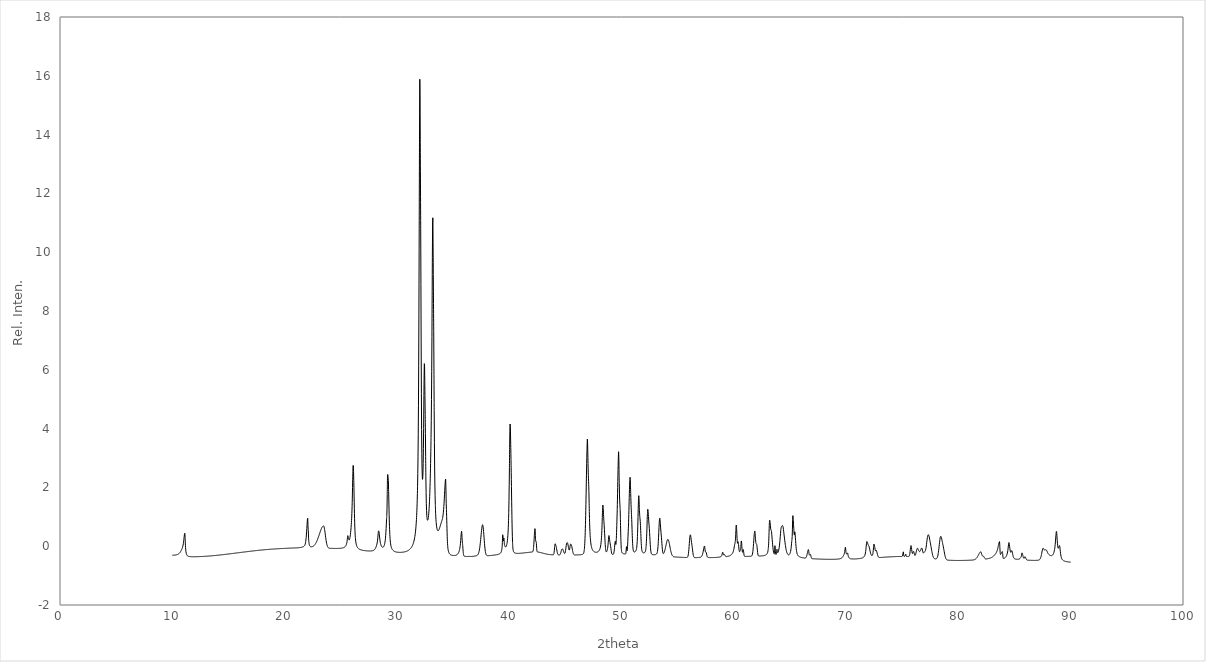
| Category | S4 |
|---|---|
| 10.0 | -0.306 |
| 10.02 | -0.306 |
| 10.04 | -0.306 |
| 10.06 | -0.306 |
| 10.08 | -0.306 |
| 10.1 | -0.306 |
| 10.12 | -0.305 |
| 10.14 | -0.305 |
| 10.16 | -0.304 |
| 10.18 | -0.304 |
| 10.2 | -0.303 |
| 10.22 | -0.302 |
| 10.24 | -0.302 |
| 10.26 | -0.301 |
| 10.28 | -0.3 |
| 10.3 | -0.298 |
| 10.32 | -0.297 |
| 10.34 | -0.295 |
| 10.36 | -0.294 |
| 10.38 | -0.292 |
| 10.4 | -0.289 |
| 10.42 | -0.287 |
| 10.44 | -0.284 |
| 10.46 | -0.281 |
| 10.48 | -0.278 |
| 10.5 | -0.274 |
| 10.52 | -0.27 |
| 10.54 | -0.266 |
| 10.56 | -0.261 |
| 10.58 | -0.255 |
| 10.6 | -0.249 |
| 10.62 | -0.242 |
| 10.64 | -0.234 |
| 10.66 | -0.226 |
| 10.68 | -0.217 |
| 10.7 | -0.206 |
| 10.72 | -0.195 |
| 10.74 | -0.183 |
| 10.76 | -0.169 |
| 10.78 | -0.155 |
| 10.8 | -0.14 |
| 10.82 | -0.125 |
| 10.84 | -0.108 |
| 10.86 | -0.09 |
| 10.88 | -0.071 |
| 10.9 | -0.05 |
| 10.92 | -0.025 |
| 10.94 | 0.004 |
| 10.96 | 0.039 |
| 10.98 | 0.082 |
| 11.0 | 0.135 |
| 11.02 | 0.197 |
| 11.04 | 0.265 |
| 11.06 | 0.334 |
| 11.08 | 0.395 |
| 11.1 | 0.438 |
| 11.12 | 0.437 |
| 11.14 | 0.291 |
| 11.16 | 0.106 |
| 11.18 | -0.044 |
| 11.2 | -0.137 |
| 11.22 | -0.197 |
| 11.24 | -0.239 |
| 11.26 | -0.268 |
| 11.28 | -0.289 |
| 11.3 | -0.304 |
| 11.32 | -0.314 |
| 11.34 | -0.323 |
| 11.36 | -0.329 |
| 11.38 | -0.334 |
| 11.4 | -0.338 |
| 11.42 | -0.341 |
| 11.44 | -0.344 |
| 11.46 | -0.346 |
| 11.48 | -0.348 |
| 11.5 | -0.349 |
| 11.52 | -0.35 |
| 11.54 | -0.352 |
| 11.56 | -0.353 |
| 11.58 | -0.353 |
| 11.6 | -0.354 |
| 11.62 | -0.355 |
| 11.64 | -0.355 |
| 11.66 | -0.356 |
| 11.68 | -0.356 |
| 11.7 | -0.357 |
| 11.72 | -0.357 |
| 11.74 | -0.357 |
| 11.76 | -0.358 |
| 11.78 | -0.358 |
| 11.8 | -0.358 |
| 11.82 | -0.358 |
| 11.84 | -0.358 |
| 11.86 | -0.358 |
| 11.88 | -0.358 |
| 11.9 | -0.358 |
| 11.92 | -0.358 |
| 11.94 | -0.358 |
| 11.96 | -0.358 |
| 11.98 | -0.358 |
| 12.0 | -0.358 |
| 12.02 | -0.358 |
| 12.04 | -0.358 |
| 12.06 | -0.358 |
| 12.08 | -0.358 |
| 12.1 | -0.358 |
| 12.12 | -0.358 |
| 12.14 | -0.358 |
| 12.16 | -0.357 |
| 12.18 | -0.357 |
| 12.2 | -0.357 |
| 12.22 | -0.357 |
| 12.24 | -0.357 |
| 12.26 | -0.356 |
| 12.28 | -0.356 |
| 12.3 | -0.356 |
| 12.32 | -0.356 |
| 12.34 | -0.355 |
| 12.36 | -0.355 |
| 12.38 | -0.355 |
| 12.4 | -0.355 |
| 12.42 | -0.354 |
| 12.44 | -0.354 |
| 12.46 | -0.354 |
| 12.48 | -0.353 |
| 12.5 | -0.353 |
| 12.52 | -0.353 |
| 12.54 | -0.352 |
| 12.56 | -0.352 |
| 12.58 | -0.352 |
| 12.6 | -0.351 |
| 12.62 | -0.351 |
| 12.64 | -0.35 |
| 12.66 | -0.35 |
| 12.68 | -0.35 |
| 12.7 | -0.349 |
| 12.72 | -0.349 |
| 12.74 | -0.348 |
| 12.76 | -0.348 |
| 12.78 | -0.347 |
| 12.8 | -0.347 |
| 12.82 | -0.347 |
| 12.84 | -0.346 |
| 12.86 | -0.346 |
| 12.88 | -0.345 |
| 12.9 | -0.345 |
| 12.92 | -0.344 |
| 12.94 | -0.344 |
| 12.96 | -0.343 |
| 12.98 | -0.343 |
| 13.0 | -0.342 |
| 13.02 | -0.342 |
| 13.04 | -0.341 |
| 13.06 | -0.34 |
| 13.08 | -0.34 |
| 13.1 | -0.339 |
| 13.12 | -0.339 |
| 13.14 | -0.338 |
| 13.16 | -0.338 |
| 13.18 | -0.337 |
| 13.2 | -0.336 |
| 13.22 | -0.336 |
| 13.24 | -0.335 |
| 13.26 | -0.335 |
| 13.28 | -0.334 |
| 13.3 | -0.334 |
| 13.32 | -0.333 |
| 13.34 | -0.333 |
| 13.36 | -0.332 |
| 13.38 | -0.331 |
| 13.4 | -0.331 |
| 13.42 | -0.33 |
| 13.44 | -0.329 |
| 13.46 | -0.329 |
| 13.48 | -0.328 |
| 13.5 | -0.327 |
| 13.52 | -0.327 |
| 13.54 | -0.326 |
| 13.56 | -0.325 |
| 13.58 | -0.325 |
| 13.6 | -0.324 |
| 13.62 | -0.323 |
| 13.64 | -0.322 |
| 13.66 | -0.322 |
| 13.68 | -0.321 |
| 13.7 | -0.32 |
| 13.72 | -0.32 |
| 13.74 | -0.319 |
| 13.76 | -0.318 |
| 13.78 | -0.317 |
| 13.8 | -0.317 |
| 13.82 | -0.316 |
| 13.84 | -0.315 |
| 13.86 | -0.314 |
| 13.88 | -0.314 |
| 13.9 | -0.313 |
| 13.92 | -0.312 |
| 13.94 | -0.311 |
| 13.96 | -0.311 |
| 13.98 | -0.31 |
| 14.0 | -0.309 |
| 14.02 | -0.308 |
| 14.04 | -0.307 |
| 14.06 | -0.307 |
| 14.08 | -0.306 |
| 14.1 | -0.305 |
| 14.12 | -0.304 |
| 14.14 | -0.303 |
| 14.16 | -0.302 |
| 14.18 | -0.302 |
| 14.2 | -0.301 |
| 14.22 | -0.3 |
| 14.24 | -0.299 |
| 14.26 | -0.298 |
| 14.28 | -0.298 |
| 14.3 | -0.297 |
| 14.32 | -0.296 |
| 14.34 | -0.295 |
| 14.36 | -0.294 |
| 14.38 | -0.293 |
| 14.4 | -0.292 |
| 14.42 | -0.292 |
| 14.44 | -0.291 |
| 14.46 | -0.29 |
| 14.48 | -0.289 |
| 14.5 | -0.288 |
| 14.52 | -0.287 |
| 14.54 | -0.286 |
| 14.56 | -0.285 |
| 14.58 | -0.285 |
| 14.6 | -0.284 |
| 14.62 | -0.283 |
| 14.64 | -0.282 |
| 14.66 | -0.281 |
| 14.68 | -0.28 |
| 14.7 | -0.279 |
| 14.72 | -0.278 |
| 14.74 | -0.277 |
| 14.76 | -0.276 |
| 14.78 | -0.275 |
| 14.8 | -0.275 |
| 14.82 | -0.274 |
| 14.84 | -0.273 |
| 14.86 | -0.272 |
| 14.88 | -0.271 |
| 14.9 | -0.27 |
| 14.92 | -0.269 |
| 14.94 | -0.268 |
| 14.96 | -0.267 |
| 14.98 | -0.266 |
| 15.0 | -0.265 |
| 15.02 | -0.264 |
| 15.04 | -0.263 |
| 15.06 | -0.263 |
| 15.08 | -0.262 |
| 15.1 | -0.261 |
| 15.12 | -0.26 |
| 15.14 | -0.259 |
| 15.16 | -0.258 |
| 15.18 | -0.257 |
| 15.2 | -0.256 |
| 15.22 | -0.255 |
| 15.24 | -0.254 |
| 15.26 | -0.253 |
| 15.28 | -0.252 |
| 15.3 | -0.251 |
| 15.32 | -0.25 |
| 15.34 | -0.249 |
| 15.36 | -0.248 |
| 15.38 | -0.247 |
| 15.4 | -0.246 |
| 15.42 | -0.245 |
| 15.44 | -0.244 |
| 15.46 | -0.243 |
| 15.48 | -0.242 |
| 15.5 | -0.241 |
| 15.52 | -0.24 |
| 15.54 | -0.24 |
| 15.56 | -0.239 |
| 15.58 | -0.238 |
| 15.6 | -0.237 |
| 15.62 | -0.236 |
| 15.64 | -0.235 |
| 15.66 | -0.234 |
| 15.68 | -0.233 |
| 15.7 | -0.232 |
| 15.72 | -0.231 |
| 15.74 | -0.23 |
| 15.76 | -0.229 |
| 15.78 | -0.228 |
| 15.8 | -0.227 |
| 15.82 | -0.226 |
| 15.84 | -0.225 |
| 15.86 | -0.224 |
| 15.88 | -0.223 |
| 15.9 | -0.222 |
| 15.92 | -0.221 |
| 15.94 | -0.22 |
| 15.96 | -0.219 |
| 15.98 | -0.218 |
| 16.0 | -0.217 |
| 16.02 | -0.216 |
| 16.04 | -0.215 |
| 16.06 | -0.214 |
| 16.08 | -0.213 |
| 16.1 | -0.212 |
| 16.12 | -0.211 |
| 16.14 | -0.21 |
| 16.16 | -0.209 |
| 16.18 | -0.208 |
| 16.2 | -0.207 |
| 16.22 | -0.206 |
| 16.24 | -0.206 |
| 16.26 | -0.205 |
| 16.28 | -0.204 |
| 16.3 | -0.203 |
| 16.32 | -0.202 |
| 16.34 | -0.201 |
| 16.36 | -0.2 |
| 16.38 | -0.199 |
| 16.4 | -0.198 |
| 16.42 | -0.197 |
| 16.44 | -0.196 |
| 16.46 | -0.195 |
| 16.48 | -0.194 |
| 16.5 | -0.193 |
| 16.52 | -0.192 |
| 16.54 | -0.191 |
| 16.56 | -0.19 |
| 16.58 | -0.189 |
| 16.6 | -0.188 |
| 16.62 | -0.187 |
| 16.64 | -0.186 |
| 16.66 | -0.185 |
| 16.68 | -0.184 |
| 16.7 | -0.183 |
| 16.72 | -0.182 |
| 16.74 | -0.182 |
| 16.76 | -0.181 |
| 16.78 | -0.18 |
| 16.8 | -0.179 |
| 16.82 | -0.178 |
| 16.84 | -0.177 |
| 16.86 | -0.176 |
| 16.88 | -0.175 |
| 16.9 | -0.174 |
| 16.92 | -0.173 |
| 16.94 | -0.172 |
| 16.96 | -0.171 |
| 16.98 | -0.17 |
| 17.0 | -0.17 |
| 17.02 | -0.169 |
| 17.04 | -0.168 |
| 17.06 | -0.167 |
| 17.08 | -0.166 |
| 17.1 | -0.165 |
| 17.12 | -0.164 |
| 17.14 | -0.163 |
| 17.16 | -0.162 |
| 17.18 | -0.162 |
| 17.2 | -0.161 |
| 17.22 | -0.16 |
| 17.24 | -0.159 |
| 17.26 | -0.158 |
| 17.28 | -0.157 |
| 17.3 | -0.156 |
| 17.32 | -0.155 |
| 17.34 | -0.155 |
| 17.36 | -0.154 |
| 17.38 | -0.153 |
| 17.4 | -0.152 |
| 17.42 | -0.151 |
| 17.44 | -0.15 |
| 17.46 | -0.15 |
| 17.48 | -0.149 |
| 17.5 | -0.148 |
| 17.52 | -0.147 |
| 17.54 | -0.146 |
| 17.56 | -0.145 |
| 17.58 | -0.145 |
| 17.6 | -0.144 |
| 17.62 | -0.143 |
| 17.64 | -0.142 |
| 17.66 | -0.141 |
| 17.68 | -0.141 |
| 17.7 | -0.14 |
| 17.72 | -0.139 |
| 17.74 | -0.138 |
| 17.76 | -0.137 |
| 17.78 | -0.137 |
| 17.8 | -0.136 |
| 17.82 | -0.135 |
| 17.84 | -0.134 |
| 17.86 | -0.134 |
| 17.88 | -0.133 |
| 17.9 | -0.132 |
| 17.92 | -0.131 |
| 17.94 | -0.131 |
| 17.96 | -0.13 |
| 17.98 | -0.129 |
| 18.0 | -0.128 |
| 18.02 | -0.128 |
| 18.04 | -0.127 |
| 18.06 | -0.126 |
| 18.08 | -0.126 |
| 18.1 | -0.125 |
| 18.12 | -0.124 |
| 18.14 | -0.123 |
| 18.16 | -0.123 |
| 18.18 | -0.122 |
| 18.2 | -0.121 |
| 18.22 | -0.121 |
| 18.24 | -0.12 |
| 18.26 | -0.119 |
| 18.28 | -0.119 |
| 18.3 | -0.118 |
| 18.32 | -0.117 |
| 18.34 | -0.117 |
| 18.36 | -0.116 |
| 18.38 | -0.115 |
| 18.4 | -0.115 |
| 18.42 | -0.114 |
| 18.44 | -0.113 |
| 18.46 | -0.113 |
| 18.48 | -0.112 |
| 18.5 | -0.111 |
| 18.52 | -0.111 |
| 18.54 | -0.11 |
| 18.56 | -0.11 |
| 18.58 | -0.109 |
| 18.6 | -0.108 |
| 18.62 | -0.108 |
| 18.64 | -0.107 |
| 18.66 | -0.107 |
| 18.68 | -0.106 |
| 18.7 | -0.105 |
| 18.72 | -0.105 |
| 18.74 | -0.104 |
| 18.76 | -0.104 |
| 18.78 | -0.103 |
| 18.8 | -0.102 |
| 18.82 | -0.102 |
| 18.84 | -0.101 |
| 18.86 | -0.101 |
| 18.88 | -0.1 |
| 18.9 | -0.1 |
| 18.92 | -0.099 |
| 18.94 | -0.099 |
| 18.96 | -0.098 |
| 18.98 | -0.097 |
| 19.0 | -0.097 |
| 19.02 | -0.096 |
| 19.04 | -0.096 |
| 19.06 | -0.095 |
| 19.08 | -0.095 |
| 19.1 | -0.094 |
| 19.12 | -0.094 |
| 19.14 | -0.093 |
| 19.16 | -0.093 |
| 19.18 | -0.092 |
| 19.2 | -0.092 |
| 19.22 | -0.091 |
| 19.24 | -0.091 |
| 19.26 | -0.09 |
| 19.28 | -0.09 |
| 19.3 | -0.089 |
| 19.32 | -0.089 |
| 19.34 | -0.088 |
| 19.36 | -0.088 |
| 19.38 | -0.087 |
| 19.4 | -0.087 |
| 19.42 | -0.086 |
| 19.44 | -0.086 |
| 19.46 | -0.086 |
| 19.48 | -0.085 |
| 19.5 | -0.085 |
| 19.52 | -0.084 |
| 19.54 | -0.084 |
| 19.56 | -0.083 |
| 19.58 | -0.083 |
| 19.6 | -0.082 |
| 19.62 | -0.082 |
| 19.64 | -0.082 |
| 19.66 | -0.081 |
| 19.68 | -0.081 |
| 19.7 | -0.08 |
| 19.72 | -0.08 |
| 19.74 | -0.08 |
| 19.76 | -0.079 |
| 19.78 | -0.079 |
| 19.8 | -0.078 |
| 19.82 | -0.078 |
| 19.84 | -0.078 |
| 19.86 | -0.077 |
| 19.88 | -0.077 |
| 19.9 | -0.076 |
| 19.92 | -0.076 |
| 19.94 | -0.076 |
| 19.96 | -0.075 |
| 19.98 | -0.075 |
| 20.0 | -0.075 |
| 20.02 | -0.074 |
| 20.04 | -0.074 |
| 20.06 | -0.073 |
| 20.08 | -0.073 |
| 20.1 | -0.073 |
| 20.12 | -0.072 |
| 20.14 | -0.072 |
| 20.16 | -0.072 |
| 20.18 | -0.071 |
| 20.2 | -0.071 |
| 20.22 | -0.071 |
| 20.24 | -0.07 |
| 20.26 | -0.07 |
| 20.28 | -0.07 |
| 20.3 | -0.069 |
| 20.32 | -0.069 |
| 20.34 | -0.069 |
| 20.36 | -0.068 |
| 20.38 | -0.068 |
| 20.4 | -0.068 |
| 20.42 | -0.067 |
| 20.44 | -0.067 |
| 20.46 | -0.067 |
| 20.48 | -0.066 |
| 20.5 | -0.066 |
| 20.52 | -0.066 |
| 20.54 | -0.065 |
| 20.56 | -0.065 |
| 20.58 | -0.065 |
| 20.6 | -0.064 |
| 20.62 | -0.064 |
| 20.64 | -0.064 |
| 20.66 | -0.063 |
| 20.68 | -0.063 |
| 20.7 | -0.063 |
| 20.72 | -0.062 |
| 20.74 | -0.062 |
| 20.76 | -0.062 |
| 20.78 | -0.061 |
| 20.8 | -0.061 |
| 20.82 | -0.061 |
| 20.84 | -0.06 |
| 20.86 | -0.06 |
| 20.88 | -0.06 |
| 20.9 | -0.059 |
| 20.92 | -0.059 |
| 20.94 | -0.059 |
| 20.96 | -0.058 |
| 20.98 | -0.058 |
| 21.0 | -0.058 |
| 21.02 | -0.057 |
| 21.04 | -0.057 |
| 21.06 | -0.056 |
| 21.08 | -0.056 |
| 21.1 | -0.055 |
| 21.12 | -0.055 |
| 21.14 | -0.054 |
| 21.16 | -0.054 |
| 21.18 | -0.053 |
| 21.2 | -0.053 |
| 21.22 | -0.052 |
| 21.24 | -0.052 |
| 21.26 | -0.051 |
| 21.28 | -0.05 |
| 21.3 | -0.05 |
| 21.32 | -0.049 |
| 21.34 | -0.048 |
| 21.36 | -0.047 |
| 21.38 | -0.046 |
| 21.4 | -0.045 |
| 21.42 | -0.043 |
| 21.44 | -0.042 |
| 21.46 | -0.041 |
| 21.48 | -0.039 |
| 21.5 | -0.037 |
| 21.52 | -0.036 |
| 21.54 | -0.034 |
| 21.56 | -0.032 |
| 21.58 | -0.03 |
| 21.6 | -0.027 |
| 21.62 | -0.024 |
| 21.64 | -0.021 |
| 21.66 | -0.018 |
| 21.68 | -0.014 |
| 21.7 | -0.009 |
| 21.72 | -0.004 |
| 21.74 | 0.003 |
| 21.76 | 0.011 |
| 21.78 | 0.022 |
| 21.8 | 0.036 |
| 21.82 | 0.054 |
| 21.84 | 0.079 |
| 21.86 | 0.113 |
| 21.88 | 0.158 |
| 21.9 | 0.216 |
| 21.92 | 0.29 |
| 21.94 | 0.381 |
| 21.96 | 0.488 |
| 21.98 | 0.607 |
| 22.0 | 0.73 |
| 22.02 | 0.845 |
| 22.04 | 0.936 |
| 22.06 | 0.953 |
| 22.08 | 0.713 |
| 22.1 | 0.57 |
| 22.12 | 0.445 |
| 22.14 | 0.255 |
| 22.16 | 0.152 |
| 22.18 | 0.093 |
| 22.2 | 0.053 |
| 22.22 | 0.027 |
| 22.24 | 0.01 |
| 22.26 | -0.001 |
| 22.28 | -0.008 |
| 22.3 | -0.014 |
| 22.32 | -0.017 |
| 22.34 | -0.019 |
| 22.36 | -0.02 |
| 22.38 | -0.021 |
| 22.4 | -0.02 |
| 22.42 | -0.02 |
| 22.44 | -0.018 |
| 22.46 | -0.016 |
| 22.48 | -0.013 |
| 22.5 | -0.01 |
| 22.52 | -0.007 |
| 22.54 | -0.002 |
| 22.56 | 0.002 |
| 22.58 | 0.008 |
| 22.6 | 0.014 |
| 22.62 | 0.021 |
| 22.64 | 0.028 |
| 22.66 | 0.036 |
| 22.68 | 0.045 |
| 22.7 | 0.054 |
| 22.72 | 0.066 |
| 22.74 | 0.077 |
| 22.76 | 0.089 |
| 22.78 | 0.102 |
| 22.8 | 0.117 |
| 22.82 | 0.131 |
| 22.84 | 0.147 |
| 22.86 | 0.163 |
| 22.88 | 0.18 |
| 22.9 | 0.198 |
| 22.92 | 0.217 |
| 22.94 | 0.237 |
| 22.96 | 0.257 |
| 22.98 | 0.277 |
| 23.0 | 0.299 |
| 23.02 | 0.321 |
| 23.04 | 0.343 |
| 23.06 | 0.365 |
| 23.08 | 0.388 |
| 23.1 | 0.411 |
| 23.12 | 0.434 |
| 23.14 | 0.456 |
| 23.16 | 0.479 |
| 23.18 | 0.501 |
| 23.2 | 0.522 |
| 23.22 | 0.543 |
| 23.24 | 0.563 |
| 23.26 | 0.582 |
| 23.28 | 0.6 |
| 23.3 | 0.617 |
| 23.32 | 0.632 |
| 23.34 | 0.645 |
| 23.36 | 0.658 |
| 23.38 | 0.668 |
| 23.4 | 0.676 |
| 23.42 | 0.683 |
| 23.44 | 0.687 |
| 23.46 | 0.689 |
| 23.48 | 0.685 |
| 23.5 | 0.67 |
| 23.52 | 0.648 |
| 23.54 | 0.615 |
| 23.56 | 0.573 |
| 23.58 | 0.523 |
| 23.6 | 0.468 |
| 23.62 | 0.41 |
| 23.64 | 0.351 |
| 23.66 | 0.293 |
| 23.68 | 0.238 |
| 23.7 | 0.187 |
| 23.72 | 0.141 |
| 23.74 | 0.1 |
| 23.76 | 0.065 |
| 23.78 | 0.036 |
| 23.8 | 0.011 |
| 23.82 | -0.009 |
| 23.84 | -0.025 |
| 23.86 | -0.037 |
| 23.88 | -0.046 |
| 23.9 | -0.054 |
| 23.92 | -0.059 |
| 23.94 | -0.063 |
| 23.96 | -0.066 |
| 23.98 | -0.068 |
| 24.0 | -0.069 |
| 24.02 | -0.071 |
| 24.04 | -0.071 |
| 24.06 | -0.072 |
| 24.08 | -0.072 |
| 24.1 | -0.073 |
| 24.12 | -0.073 |
| 24.14 | -0.074 |
| 24.16 | -0.074 |
| 24.18 | -0.074 |
| 24.2 | -0.074 |
| 24.22 | -0.074 |
| 24.24 | -0.075 |
| 24.26 | -0.075 |
| 24.28 | -0.075 |
| 24.3 | -0.075 |
| 24.32 | -0.075 |
| 24.34 | -0.076 |
| 24.36 | -0.076 |
| 24.38 | -0.076 |
| 24.4 | -0.076 |
| 24.42 | -0.076 |
| 24.44 | -0.076 |
| 24.46 | -0.076 |
| 24.48 | -0.076 |
| 24.5 | -0.076 |
| 24.52 | -0.076 |
| 24.54 | -0.076 |
| 24.56 | -0.076 |
| 24.58 | -0.076 |
| 24.6 | -0.076 |
| 24.62 | -0.076 |
| 24.64 | -0.076 |
| 24.66 | -0.076 |
| 24.68 | -0.076 |
| 24.7 | -0.076 |
| 24.72 | -0.076 |
| 24.74 | -0.076 |
| 24.76 | -0.076 |
| 24.78 | -0.075 |
| 24.8 | -0.075 |
| 24.82 | -0.075 |
| 24.84 | -0.074 |
| 24.86 | -0.074 |
| 24.88 | -0.074 |
| 24.9 | -0.073 |
| 24.92 | -0.073 |
| 24.94 | -0.072 |
| 24.96 | -0.071 |
| 24.98 | -0.071 |
| 25.0 | -0.07 |
| 25.02 | -0.069 |
| 25.04 | -0.068 |
| 25.06 | -0.067 |
| 25.08 | -0.066 |
| 25.1 | -0.064 |
| 25.12 | -0.063 |
| 25.14 | -0.061 |
| 25.16 | -0.06 |
| 25.18 | -0.058 |
| 25.2 | -0.056 |
| 25.22 | -0.053 |
| 25.24 | -0.051 |
| 25.26 | -0.048 |
| 25.28 | -0.045 |
| 25.3 | -0.041 |
| 25.32 | -0.037 |
| 25.34 | -0.032 |
| 25.36 | -0.027 |
| 25.38 | -0.02 |
| 25.4 | -0.013 |
| 25.42 | -0.004 |
| 25.44 | 0.007 |
| 25.46 | 0.02 |
| 25.48 | 0.037 |
| 25.5 | 0.057 |
| 25.52 | 0.082 |
| 25.54 | 0.113 |
| 25.56 | 0.156 |
| 25.58 | 0.219 |
| 25.6 | 0.3 |
| 25.62 | 0.358 |
| 25.64 | 0.346 |
| 25.66 | 0.313 |
| 25.68 | 0.294 |
| 25.7 | 0.265 |
| 25.72 | 0.228 |
| 25.74 | 0.209 |
| 25.76 | 0.211 |
| 25.78 | 0.228 |
| 25.8 | 0.256 |
| 25.82 | 0.294 |
| 25.84 | 0.342 |
| 25.86 | 0.4 |
| 25.88 | 0.468 |
| 25.9 | 0.547 |
| 25.92 | 0.639 |
| 25.94 | 0.745 |
| 25.96 | 0.871 |
| 25.98 | 1.025 |
| 26.0 | 1.222 |
| 26.02 | 1.481 |
| 26.04 | 1.808 |
| 26.06 | 2.183 |
| 26.08 | 2.531 |
| 26.1 | 2.749 |
| 26.12 | 2.74 |
| 26.14 | 2.537 |
| 26.16 | 2.237 |
| 26.18 | 1.874 |
| 26.2 | 1.473 |
| 26.22 | 1.104 |
| 26.24 | 0.804 |
| 26.26 | 0.578 |
| 26.28 | 0.414 |
| 26.3 | 0.296 |
| 26.32 | 0.211 |
| 26.34 | 0.15 |
| 26.36 | 0.103 |
| 26.38 | 0.067 |
| 26.4 | 0.038 |
| 26.42 | 0.015 |
| 26.44 | -0.004 |
| 26.46 | -0.021 |
| 26.48 | -0.035 |
| 26.5 | -0.046 |
| 26.52 | -0.057 |
| 26.54 | -0.066 |
| 26.56 | -0.074 |
| 26.58 | -0.081 |
| 26.6 | -0.087 |
| 26.62 | -0.092 |
| 26.64 | -0.097 |
| 26.66 | -0.102 |
| 26.68 | -0.106 |
| 26.7 | -0.11 |
| 26.72 | -0.113 |
| 26.74 | -0.116 |
| 26.76 | -0.119 |
| 26.78 | -0.122 |
| 26.8 | -0.124 |
| 26.82 | -0.127 |
| 26.84 | -0.129 |
| 26.86 | -0.131 |
| 26.88 | -0.133 |
| 26.9 | -0.135 |
| 26.92 | -0.137 |
| 26.94 | -0.138 |
| 26.96 | -0.14 |
| 26.98 | -0.141 |
| 27.0 | -0.143 |
| 27.02 | -0.144 |
| 27.04 | -0.145 |
| 27.06 | -0.147 |
| 27.08 | -0.148 |
| 27.1 | -0.149 |
| 27.12 | -0.15 |
| 27.14 | -0.151 |
| 27.16 | -0.152 |
| 27.18 | -0.153 |
| 27.2 | -0.154 |
| 27.22 | -0.155 |
| 27.24 | -0.155 |
| 27.26 | -0.156 |
| 27.28 | -0.157 |
| 27.3 | -0.158 |
| 27.32 | -0.158 |
| 27.34 | -0.159 |
| 27.36 | -0.159 |
| 27.38 | -0.16 |
| 27.4 | -0.16 |
| 27.42 | -0.161 |
| 27.44 | -0.161 |
| 27.46 | -0.162 |
| 27.48 | -0.162 |
| 27.5 | -0.162 |
| 27.52 | -0.162 |
| 27.54 | -0.163 |
| 27.56 | -0.163 |
| 27.58 | -0.163 |
| 27.6 | -0.163 |
| 27.62 | -0.162 |
| 27.64 | -0.162 |
| 27.66 | -0.162 |
| 27.68 | -0.161 |
| 27.7 | -0.161 |
| 27.72 | -0.16 |
| 27.74 | -0.159 |
| 27.76 | -0.158 |
| 27.78 | -0.157 |
| 27.8 | -0.156 |
| 27.82 | -0.154 |
| 27.84 | -0.152 |
| 27.86 | -0.15 |
| 27.88 | -0.148 |
| 27.9 | -0.145 |
| 27.92 | -0.141 |
| 27.94 | -0.137 |
| 27.96 | -0.133 |
| 27.98 | -0.128 |
| 28.0 | -0.121 |
| 28.02 | -0.11 |
| 28.04 | -0.101 |
| 28.06 | -0.091 |
| 28.08 | -0.079 |
| 28.1 | -0.062 |
| 28.12 | -0.046 |
| 28.14 | -0.027 |
| 28.16 | -0.006 |
| 28.18 | 0.017 |
| 28.2 | 0.043 |
| 28.22 | 0.072 |
| 28.24 | 0.106 |
| 28.26 | 0.15 |
| 28.28 | 0.209 |
| 28.3 | 0.287 |
| 28.32 | 0.379 |
| 28.34 | 0.464 |
| 28.36 | 0.512 |
| 28.38 | 0.521 |
| 28.4 | 0.494 |
| 28.42 | 0.446 |
| 28.44 | 0.383 |
| 28.46 | 0.313 |
| 28.48 | 0.244 |
| 28.5 | 0.183 |
| 28.52 | 0.134 |
| 28.54 | 0.096 |
| 28.56 | 0.066 |
| 28.58 | 0.041 |
| 28.6 | 0.021 |
| 28.62 | 0.004 |
| 28.64 | -0.01 |
| 28.66 | -0.021 |
| 28.68 | -0.029 |
| 28.7 | -0.034 |
| 28.72 | -0.037 |
| 28.74 | -0.037 |
| 28.76 | -0.035 |
| 28.78 | -0.031 |
| 28.8 | -0.024 |
| 28.82 | -0.014 |
| 28.84 | -0.001 |
| 28.86 | 0.015 |
| 28.88 | 0.036 |
| 28.9 | 0.063 |
| 28.92 | 0.097 |
| 28.94 | 0.14 |
| 28.96 | 0.195 |
| 28.98 | 0.265 |
| 29.0 | 0.356 |
| 29.02 | 0.471 |
| 29.04 | 0.607 |
| 29.06 | 0.752 |
| 29.08 | 0.892 |
| 29.1 | 1.041 |
| 29.12 | 1.287 |
| 29.14 | 1.75 |
| 29.16 | 2.293 |
| 29.18 | 2.439 |
| 29.2 | 2.391 |
| 29.22 | 2.341 |
| 29.24 | 2.234 |
| 29.26 | 1.927 |
| 29.28 | 1.574 |
| 29.3 | 1.228 |
| 29.32 | 0.924 |
| 29.34 | 0.674 |
| 29.36 | 0.479 |
| 29.38 | 0.331 |
| 29.4 | 0.22 |
| 29.42 | 0.139 |
| 29.44 | 0.078 |
| 29.46 | 0.032 |
| 29.48 | -0.004 |
| 29.5 | -0.032 |
| 29.52 | -0.055 |
| 29.54 | -0.074 |
| 29.56 | -0.091 |
| 29.58 | -0.104 |
| 29.6 | -0.116 |
| 29.62 | -0.126 |
| 29.64 | -0.135 |
| 29.66 | -0.143 |
| 29.68 | -0.15 |
| 29.7 | -0.157 |
| 29.72 | -0.162 |
| 29.74 | -0.167 |
| 29.76 | -0.171 |
| 29.78 | -0.175 |
| 29.8 | -0.179 |
| 29.82 | -0.183 |
| 29.84 | -0.186 |
| 29.86 | -0.189 |
| 29.88 | -0.191 |
| 29.9 | -0.194 |
| 29.92 | -0.196 |
| 29.94 | -0.197 |
| 29.96 | -0.199 |
| 29.98 | -0.201 |
| 30.0 | -0.202 |
| 30.02 | -0.203 |
| 30.04 | -0.204 |
| 30.06 | -0.205 |
| 30.08 | -0.206 |
| 30.1 | -0.207 |
| 30.12 | -0.208 |
| 30.14 | -0.208 |
| 30.16 | -0.209 |
| 30.18 | -0.209 |
| 30.2 | -0.209 |
| 30.22 | -0.21 |
| 30.24 | -0.21 |
| 30.26 | -0.21 |
| 30.28 | -0.21 |
| 30.3 | -0.21 |
| 30.32 | -0.21 |
| 30.34 | -0.209 |
| 30.36 | -0.209 |
| 30.38 | -0.209 |
| 30.4 | -0.208 |
| 30.42 | -0.208 |
| 30.44 | -0.207 |
| 30.46 | -0.206 |
| 30.48 | -0.206 |
| 30.5 | -0.205 |
| 30.52 | -0.204 |
| 30.54 | -0.203 |
| 30.56 | -0.202 |
| 30.58 | -0.2 |
| 30.6 | -0.199 |
| 30.62 | -0.198 |
| 30.64 | -0.196 |
| 30.66 | -0.195 |
| 30.68 | -0.193 |
| 30.7 | -0.191 |
| 30.72 | -0.19 |
| 30.74 | -0.188 |
| 30.76 | -0.185 |
| 30.78 | -0.183 |
| 30.8 | -0.181 |
| 30.82 | -0.178 |
| 30.84 | -0.176 |
| 30.86 | -0.173 |
| 30.88 | -0.17 |
| 30.9 | -0.167 |
| 30.92 | -0.163 |
| 30.94 | -0.16 |
| 30.96 | -0.156 |
| 30.98 | -0.152 |
| 31.0 | -0.147 |
| 31.02 | -0.143 |
| 31.04 | -0.138 |
| 31.06 | -0.133 |
| 31.08 | -0.127 |
| 31.1 | -0.122 |
| 31.12 | -0.115 |
| 31.14 | -0.109 |
| 31.16 | -0.102 |
| 31.18 | -0.094 |
| 31.2 | -0.086 |
| 31.22 | -0.078 |
| 31.24 | -0.068 |
| 31.26 | -0.059 |
| 31.28 | -0.048 |
| 31.3 | -0.037 |
| 31.32 | -0.024 |
| 31.34 | -0.011 |
| 31.36 | 0.003 |
| 31.38 | 0.019 |
| 31.4 | 0.036 |
| 31.42 | 0.054 |
| 31.44 | 0.075 |
| 31.46 | 0.097 |
| 31.48 | 0.121 |
| 31.5 | 0.148 |
| 31.52 | 0.177 |
| 31.54 | 0.21 |
| 31.56 | 0.246 |
| 31.58 | 0.287 |
| 31.6 | 0.333 |
| 31.62 | 0.385 |
| 31.64 | 0.444 |
| 31.66 | 0.511 |
| 31.68 | 0.588 |
| 31.7 | 0.677 |
| 31.72 | 0.782 |
| 31.74 | 0.905 |
| 31.76 | 1.051 |
| 31.78 | 1.227 |
| 31.8 | 1.441 |
| 31.82 | 1.707 |
| 31.84 | 2.042 |
| 31.86 | 2.472 |
| 31.88 | 3.037 |
| 31.9 | 3.788 |
| 31.92 | 4.793 |
| 31.94 | 6.135 |
| 31.96 | 7.891 |
| 31.98 | 10.08 |
| 32.0 | 12.526 |
| 32.02 | 14.706 |
| 32.04 | 15.883 |
| 32.06 | 15.335 |
| 32.08 | 13.843 |
| 32.1 | 12.32 |
| 32.12 | 10.802 |
| 32.14 | 8.909 |
| 32.16 | 6.879 |
| 32.18 | 5.189 |
| 32.2 | 3.968 |
| 32.22 | 3.154 |
| 32.24 | 2.652 |
| 32.26 | 2.377 |
| 32.28 | 2.273 |
| 32.3 | 2.312 |
| 32.32 | 2.488 |
| 32.34 | 2.816 |
| 32.36 | 3.317 |
| 32.38 | 4.003 |
| 32.4 | 4.837 |
| 32.42 | 5.664 |
| 32.44 | 6.211 |
| 32.46 | 6.179 |
| 32.48 | 5.645 |
| 32.5 | 5.043 |
| 32.52 | 4.48 |
| 32.54 | 3.833 |
| 32.56 | 3.059 |
| 32.58 | 2.358 |
| 32.6 | 1.826 |
| 32.62 | 1.456 |
| 32.64 | 1.213 |
| 32.66 | 1.059 |
| 32.68 | 0.964 |
| 32.7 | 0.91 |
| 32.72 | 0.885 |
| 32.74 | 0.882 |
| 32.76 | 0.897 |
| 32.78 | 0.929 |
| 32.8 | 0.978 |
| 32.82 | 1.043 |
| 32.84 | 1.127 |
| 32.86 | 1.231 |
| 32.88 | 1.358 |
| 32.9 | 1.511 |
| 32.92 | 1.695 |
| 32.94 | 1.912 |
| 32.96 | 2.168 |
| 32.98 | 2.465 |
| 33.0 | 2.81 |
| 33.02 | 3.212 |
| 33.04 | 3.687 |
| 33.06 | 4.266 |
| 33.08 | 4.998 |
| 33.1 | 5.941 |
| 33.12 | 7.136 |
| 33.14 | 8.538 |
| 33.16 | 9.935 |
| 33.18 | 10.959 |
| 33.2 | 11.172 |
| 33.22 | 10.333 |
| 33.24 | 9.235 |
| 33.26 | 8.252 |
| 33.28 | 7.257 |
| 33.3 | 5.951 |
| 33.32 | 4.615 |
| 33.34 | 3.526 |
| 33.36 | 2.725 |
| 33.38 | 2.149 |
| 33.4 | 1.734 |
| 33.42 | 1.429 |
| 33.44 | 1.202 |
| 33.46 | 1.03 |
| 33.48 | 0.899 |
| 33.5 | 0.798 |
| 33.52 | 0.72 |
| 33.54 | 0.66 |
| 33.56 | 0.614 |
| 33.58 | 0.58 |
| 33.6 | 0.556 |
| 33.62 | 0.539 |
| 33.64 | 0.529 |
| 33.66 | 0.526 |
| 33.68 | 0.527 |
| 33.7 | 0.533 |
| 33.72 | 0.544 |
| 33.74 | 0.557 |
| 33.76 | 0.574 |
| 33.78 | 0.594 |
| 33.8 | 0.616 |
| 33.82 | 0.639 |
| 33.84 | 0.664 |
| 33.86 | 0.69 |
| 33.88 | 0.715 |
| 33.9 | 0.741 |
| 33.92 | 0.766 |
| 33.94 | 0.791 |
| 33.96 | 0.814 |
| 33.98 | 0.838 |
| 34.0 | 0.861 |
| 34.02 | 0.885 |
| 34.04 | 0.912 |
| 34.06 | 0.944 |
| 34.08 | 0.981 |
| 34.1 | 1.027 |
| 34.12 | 1.085 |
| 34.14 | 1.157 |
| 34.16 | 1.245 |
| 34.18 | 1.35 |
| 34.2 | 1.472 |
| 34.22 | 1.608 |
| 34.24 | 1.753 |
| 34.26 | 1.899 |
| 34.28 | 2.038 |
| 34.3 | 2.159 |
| 34.32 | 2.252 |
| 34.34 | 2.283 |
| 34.36 | 2.041 |
| 34.38 | 1.683 |
| 34.4 | 1.369 |
| 34.42 | 1.135 |
| 34.44 | 0.885 |
| 34.46 | 0.59 |
| 34.48 | 0.338 |
| 34.5 | 0.153 |
| 34.52 | 0.026 |
| 34.54 | -0.059 |
| 34.56 | -0.117 |
| 34.58 | -0.158 |
| 34.6 | -0.188 |
| 34.62 | -0.211 |
| 34.64 | -0.229 |
| 34.66 | -0.244 |
| 34.68 | -0.255 |
| 34.7 | -0.265 |
| 34.72 | -0.273 |
| 34.74 | -0.28 |
| 34.76 | -0.286 |
| 34.78 | -0.291 |
| 34.8 | -0.295 |
| 34.82 | -0.299 |
| 34.84 | -0.302 |
| 34.86 | -0.305 |
| 34.88 | -0.307 |
| 34.9 | -0.309 |
| 34.92 | -0.311 |
| 34.94 | -0.312 |
| 34.96 | -0.313 |
| 34.98 | -0.314 |
| 35.0 | -0.315 |
| 35.02 | -0.315 |
| 35.04 | -0.316 |
| 35.06 | -0.316 |
| 35.08 | -0.315 |
| 35.1 | -0.315 |
| 35.12 | -0.314 |
| 35.14 | -0.314 |
| 35.16 | -0.313 |
| 35.18 | -0.311 |
| 35.2 | -0.314 |
| 35.22 | -0.312 |
| 35.24 | -0.309 |
| 35.26 | -0.307 |
| 35.28 | -0.306 |
| 35.3 | -0.302 |
| 35.32 | -0.298 |
| 35.34 | -0.293 |
| 35.36 | -0.288 |
| 35.38 | -0.282 |
| 35.4 | -0.274 |
| 35.42 | -0.266 |
| 35.44 | -0.256 |
| 35.46 | -0.244 |
| 35.48 | -0.231 |
| 35.5 | -0.215 |
| 35.52 | -0.196 |
| 35.54 | -0.174 |
| 35.56 | -0.147 |
| 35.58 | -0.117 |
| 35.6 | -0.078 |
| 35.62 | -0.03 |
| 35.64 | 0.029 |
| 35.66 | 0.101 |
| 35.68 | 0.188 |
| 35.7 | 0.287 |
| 35.72 | 0.386 |
| 35.74 | 0.467 |
| 35.76 | 0.511 |
| 35.78 | 0.442 |
| 35.8 | 0.305 |
| 35.82 | 0.181 |
| 35.84 | 0.096 |
| 35.86 | 0.025 |
| 35.88 | -0.077 |
| 35.9 | -0.177 |
| 35.92 | -0.252 |
| 35.94 | -0.297 |
| 35.96 | -0.32 |
| 35.98 | -0.332 |
| 36.0 | -0.338 |
| 36.02 | -0.34 |
| 36.04 | -0.343 |
| 36.06 | -0.345 |
| 36.08 | -0.347 |
| 36.1 | -0.348 |
| 36.12 | -0.348 |
| 36.14 | -0.349 |
| 36.16 | -0.349 |
| 36.18 | -0.349 |
| 36.2 | -0.35 |
| 36.22 | -0.35 |
| 36.24 | -0.35 |
| 36.26 | -0.35 |
| 36.28 | -0.35 |
| 36.3 | -0.35 |
| 36.32 | -0.35 |
| 36.34 | -0.35 |
| 36.36 | -0.349 |
| 36.38 | -0.349 |
| 36.4 | -0.349 |
| 36.42 | -0.349 |
| 36.44 | -0.348 |
| 36.46 | -0.348 |
| 36.48 | -0.348 |
| 36.5 | -0.347 |
| 36.52 | -0.351 |
| 36.54 | -0.35 |
| 36.56 | -0.35 |
| 36.58 | -0.349 |
| 36.6 | -0.35 |
| 36.62 | -0.35 |
| 36.64 | -0.349 |
| 36.66 | -0.349 |
| 36.68 | -0.348 |
| 36.7 | -0.347 |
| 36.72 | -0.347 |
| 36.74 | -0.346 |
| 36.76 | -0.345 |
| 36.78 | -0.344 |
| 36.8 | -0.344 |
| 36.82 | -0.343 |
| 36.84 | -0.342 |
| 36.86 | -0.341 |
| 36.88 | -0.34 |
| 36.9 | -0.339 |
| 36.92 | -0.338 |
| 36.94 | -0.337 |
| 36.96 | -0.335 |
| 36.98 | -0.334 |
| 37.0 | -0.332 |
| 37.02 | -0.331 |
| 37.04 | -0.329 |
| 37.06 | -0.327 |
| 37.08 | -0.325 |
| 37.1 | -0.322 |
| 37.12 | -0.318 |
| 37.14 | -0.314 |
| 37.16 | -0.309 |
| 37.18 | -0.302 |
| 37.2 | -0.294 |
| 37.22 | -0.283 |
| 37.24 | -0.27 |
| 37.26 | -0.253 |
| 37.28 | -0.231 |
| 37.3 | -0.206 |
| 37.32 | -0.174 |
| 37.34 | -0.137 |
| 37.36 | -0.092 |
| 37.38 | -0.041 |
| 37.4 | 0.017 |
| 37.42 | 0.083 |
| 37.44 | 0.154 |
| 37.46 | 0.23 |
| 37.48 | 0.309 |
| 37.5 | 0.389 |
| 37.52 | 0.467 |
| 37.54 | 0.541 |
| 37.56 | 0.608 |
| 37.58 | 0.663 |
| 37.6 | 0.704 |
| 37.62 | 0.729 |
| 37.64 | 0.727 |
| 37.66 | 0.699 |
| 37.68 | 0.647 |
| 37.7 | 0.577 |
| 37.72 | 0.494 |
| 37.74 | 0.398 |
| 37.76 | 0.297 |
| 37.78 | 0.196 |
| 37.8 | 0.099 |
| 37.82 | 0.011 |
| 37.84 | -0.066 |
| 37.86 | -0.131 |
| 37.88 | -0.184 |
| 37.9 | -0.225 |
| 37.92 | -0.257 |
| 37.94 | -0.28 |
| 37.96 | -0.296 |
| 37.98 | -0.307 |
| 38.0 | -0.315 |
| 38.02 | -0.319 |
| 38.04 | -0.322 |
| 38.06 | -0.323 |
| 38.08 | -0.323 |
| 38.1 | -0.323 |
| 38.12 | -0.323 |
| 38.14 | -0.323 |
| 38.16 | -0.322 |
| 38.18 | -0.322 |
| 38.2 | -0.321 |
| 38.22 | -0.32 |
| 38.24 | -0.32 |
| 38.26 | -0.319 |
| 38.28 | -0.319 |
| 38.3 | -0.318 |
| 38.32 | -0.317 |
| 38.34 | -0.317 |
| 38.36 | -0.316 |
| 38.38 | -0.315 |
| 38.4 | -0.314 |
| 38.42 | -0.314 |
| 38.44 | -0.313 |
| 38.46 | -0.312 |
| 38.48 | -0.311 |
| 38.5 | -0.311 |
| 38.52 | -0.31 |
| 38.54 | -0.309 |
| 38.56 | -0.308 |
| 38.58 | -0.307 |
| 38.6 | -0.306 |
| 38.62 | -0.305 |
| 38.64 | -0.305 |
| 38.66 | -0.304 |
| 38.68 | -0.303 |
| 38.7 | -0.302 |
| 38.72 | -0.301 |
| 38.74 | -0.299 |
| 38.76 | -0.298 |
| 38.78 | -0.297 |
| 38.8 | -0.296 |
| 38.82 | -0.295 |
| 38.84 | -0.293 |
| 38.86 | -0.292 |
| 38.88 | -0.29 |
| 38.9 | -0.289 |
| 38.92 | -0.287 |
| 38.94 | -0.286 |
| 38.96 | -0.284 |
| 38.98 | -0.282 |
| 39.0 | -0.28 |
| 39.02 | -0.278 |
| 39.04 | -0.275 |
| 39.06 | -0.273 |
| 39.08 | -0.27 |
| 39.1 | -0.267 |
| 39.12 | -0.263 |
| 39.14 | -0.259 |
| 39.16 | -0.255 |
| 39.18 | -0.25 |
| 39.2 | -0.244 |
| 39.22 | -0.237 |
| 39.24 | -0.228 |
| 39.26 | -0.217 |
| 39.28 | -0.203 |
| 39.3 | -0.183 |
| 39.32 | -0.156 |
| 39.34 | -0.116 |
| 39.36 | -0.056 |
| 39.38 | 0.043 |
| 39.4 | 0.21 |
| 39.42 | 0.39 |
| 39.44 | 0.358 |
| 39.46 | 0.215 |
| 39.48 | 0.178 |
| 39.5 | 0.224 |
| 39.52 | 0.281 |
| 39.54 | 0.234 |
| 39.56 | 0.119 |
| 39.58 | 0.054 |
| 39.6 | 0.026 |
| 39.62 | 0.006 |
| 39.64 | -0.013 |
| 39.66 | -0.025 |
| 39.68 | -0.029 |
| 39.7 | -0.025 |
| 39.72 | -0.015 |
| 39.74 | 0.001 |
| 39.76 | 0.023 |
| 39.78 | 0.052 |
| 39.8 | 0.088 |
| 39.82 | 0.135 |
| 39.84 | 0.193 |
| 39.86 | 0.266 |
| 39.88 | 0.36 |
| 39.9 | 0.484 |
| 39.92 | 0.647 |
| 39.94 | 0.865 |
| 39.96 | 1.158 |
| 39.98 | 1.548 |
| 40.0 | 2.054 |
| 40.02 | 2.674 |
| 40.04 | 3.346 |
| 40.06 | 3.905 |
| 40.08 | 4.156 |
| 40.1 | 4.064 |
| 40.12 | 3.75 |
| 40.14 | 3.359 |
| 40.16 | 2.956 |
| 40.18 | 2.518 |
| 40.2 | 2.029 |
| 40.22 | 1.525 |
| 40.24 | 1.052 |
| 40.26 | 0.651 |
| 40.28 | 0.341 |
| 40.3 | 0.123 |
| 40.32 | -0.018 |
| 40.34 | -0.103 |
| 40.36 | -0.151 |
| 40.38 | -0.179 |
| 40.4 | -0.195 |
| 40.42 | -0.206 |
| 40.44 | -0.214 |
| 40.46 | -0.22 |
| 40.48 | -0.225 |
| 40.5 | -0.229 |
| 40.52 | -0.232 |
| 40.54 | -0.235 |
| 40.56 | -0.237 |
| 40.58 | -0.239 |
| 40.6 | -0.24 |
| 40.62 | -0.242 |
| 40.64 | -0.243 |
| 40.66 | -0.243 |
| 40.68 | -0.244 |
| 40.7 | -0.244 |
| 40.72 | -0.245 |
| 40.74 | -0.245 |
| 40.76 | -0.245 |
| 40.78 | -0.245 |
| 40.8 | -0.245 |
| 40.82 | -0.245 |
| 40.84 | -0.244 |
| 40.86 | -0.244 |
| 40.88 | -0.244 |
| 40.9 | -0.243 |
| 40.92 | -0.243 |
| 40.94 | -0.242 |
| 40.96 | -0.242 |
| 40.98 | -0.241 |
| 41.0 | -0.241 |
| 41.02 | -0.24 |
| 41.04 | -0.239 |
| 41.06 | -0.239 |
| 41.08 | -0.238 |
| 41.1 | -0.237 |
| 41.12 | -0.236 |
| 41.14 | -0.235 |
| 41.16 | -0.235 |
| 41.18 | -0.234 |
| 41.2 | -0.233 |
| 41.22 | -0.232 |
| 41.24 | -0.231 |
| 41.26 | -0.23 |
| 41.28 | -0.229 |
| 41.3 | -0.229 |
| 41.32 | -0.228 |
| 41.34 | -0.227 |
| 41.36 | -0.226 |
| 41.38 | -0.225 |
| 41.4 | -0.224 |
| 41.42 | -0.223 |
| 41.44 | -0.222 |
| 41.46 | -0.221 |
| 41.48 | -0.22 |
| 41.5 | -0.22 |
| 41.52 | -0.219 |
| 41.54 | -0.218 |
| 41.56 | -0.217 |
| 41.58 | -0.216 |
| 41.6 | -0.215 |
| 41.62 | -0.214 |
| 41.64 | -0.213 |
| 41.66 | -0.212 |
| 41.68 | -0.212 |
| 41.7 | -0.211 |
| 41.72 | -0.21 |
| 41.74 | -0.21 |
| 41.76 | -0.209 |
| 41.78 | -0.208 |
| 41.8 | -0.208 |
| 41.82 | -0.207 |
| 41.84 | -0.206 |
| 41.86 | -0.205 |
| 41.88 | -0.205 |
| 41.9 | -0.204 |
| 41.92 | -0.203 |
| 41.94 | -0.203 |
| 41.96 | -0.202 |
| 41.98 | -0.201 |
| 42.0 | -0.201 |
| 42.02 | -0.2 |
| 42.04 | -0.199 |
| 42.06 | -0.197 |
| 42.08 | -0.192 |
| 42.1 | -0.183 |
| 42.12 | -0.165 |
| 42.14 | -0.132 |
| 42.16 | -0.079 |
| 42.18 | 0.001 |
| 42.2 | 0.109 |
| 42.22 | 0.237 |
| 42.24 | 0.371 |
| 42.26 | 0.492 |
| 42.28 | 0.581 |
| 42.3 | 0.598 |
| 42.32 | 0.448 |
| 42.34 | 0.272 |
| 42.36 | 0.18 |
| 42.38 | 0.161 |
| 42.4 | 0.159 |
| 42.42 | 0.095 |
| 42.44 | -0.028 |
| 42.46 | -0.127 |
| 42.48 | -0.177 |
| 42.5 | -0.193 |
| 42.52 | -0.197 |
| 42.54 | -0.198 |
| 42.56 | -0.199 |
| 42.58 | -0.2 |
| 42.6 | -0.201 |
| 42.62 | -0.202 |
| 42.64 | -0.204 |
| 42.66 | -0.205 |
| 42.68 | -0.206 |
| 42.7 | -0.208 |
| 42.72 | -0.209 |
| 42.74 | -0.211 |
| 42.76 | -0.213 |
| 42.78 | -0.215 |
| 42.8 | -0.216 |
| 42.82 | -0.218 |
| 42.84 | -0.22 |
| 42.86 | -0.222 |
| 42.88 | -0.224 |
| 42.9 | -0.226 |
| 42.92 | -0.229 |
| 42.94 | -0.231 |
| 42.96 | -0.233 |
| 42.98 | -0.235 |
| 43.0 | -0.237 |
| 43.02 | -0.239 |
| 43.04 | -0.241 |
| 43.06 | -0.243 |
| 43.08 | -0.245 |
| 43.1 | -0.247 |
| 43.12 | -0.249 |
| 43.14 | -0.251 |
| 43.16 | -0.253 |
| 43.18 | -0.255 |
| 43.2 | -0.257 |
| 43.22 | -0.259 |
| 43.24 | -0.261 |
| 43.26 | -0.263 |
| 43.28 | -0.264 |
| 43.3 | -0.266 |
| 43.32 | -0.267 |
| 43.34 | -0.269 |
| 43.36 | -0.271 |
| 43.38 | -0.272 |
| 43.4 | -0.273 |
| 43.42 | -0.275 |
| 43.44 | -0.276 |
| 43.46 | -0.277 |
| 43.48 | -0.278 |
| 43.5 | -0.279 |
| 43.52 | -0.281 |
| 43.54 | -0.282 |
| 43.56 | -0.283 |
| 43.58 | -0.283 |
| 43.6 | -0.284 |
| 43.62 | -0.285 |
| 43.64 | -0.286 |
| 43.66 | -0.287 |
| 43.68 | -0.287 |
| 43.7 | -0.288 |
| 43.72 | -0.289 |
| 43.74 | -0.289 |
| 43.76 | -0.29 |
| 43.78 | -0.291 |
| 43.8 | -0.291 |
| 43.82 | -0.292 |
| 43.84 | -0.292 |
| 43.86 | -0.293 |
| 43.88 | -0.293 |
| 43.9 | -0.293 |
| 43.92 | -0.292 |
| 43.94 | -0.289 |
| 43.96 | -0.279 |
| 43.98 | -0.255 |
| 44.0 | -0.21 |
| 44.02 | -0.14 |
| 44.04 | -0.053 |
| 44.06 | 0.028 |
| 44.08 | 0.075 |
| 44.1 | 0.081 |
| 44.12 | 0.066 |
| 44.14 | 0.042 |
| 44.16 | 0.017 |
| 44.18 | -0.009 |
| 44.2 | -0.044 |
| 44.22 | -0.086 |
| 44.24 | -0.128 |
| 44.26 | -0.171 |
| 44.28 | -0.21 |
| 44.3 | -0.242 |
| 44.32 | -0.265 |
| 44.34 | -0.281 |
| 44.36 | -0.289 |
| 44.38 | -0.294 |
| 44.4 | -0.296 |
| 44.42 | -0.297 |
| 44.44 | -0.297 |
| 44.46 | -0.297 |
| 44.48 | -0.296 |
| 44.5 | -0.294 |
| 44.52 | -0.289 |
| 44.54 | -0.28 |
| 44.56 | -0.265 |
| 44.58 | -0.244 |
| 44.6 | -0.216 |
| 44.62 | -0.184 |
| 44.64 | -0.151 |
| 44.66 | -0.124 |
| 44.68 | -0.106 |
| 44.7 | -0.097 |
| 44.72 | -0.093 |
| 44.74 | -0.094 |
| 44.76 | -0.099 |
| 44.78 | -0.111 |
| 44.8 | -0.129 |
| 44.82 | -0.151 |
| 44.84 | -0.174 |
| 44.86 | -0.196 |
| 44.88 | -0.215 |
| 44.9 | -0.232 |
| 44.92 | -0.243 |
| 44.94 | -0.247 |
| 44.96 | -0.242 |
| 44.98 | -0.224 |
| 45.0 | -0.193 |
| 45.02 | -0.147 |
| 45.04 | -0.091 |
| 45.06 | -0.029 |
| 45.08 | 0.028 |
| 45.1 | 0.074 |
| 45.12 | 0.1 |
| 45.14 | 0.116 |
| 45.16 | 0.122 |
| 45.18 | 0.12 |
| 45.2 | 0.106 |
| 45.22 | 0.08 |
| 45.24 | 0.042 |
| 45.26 | -0.001 |
| 45.28 | -0.044 |
| 45.3 | -0.083 |
| 45.32 | -0.114 |
| 45.34 | -0.132 |
| 45.36 | -0.129 |
| 45.38 | -0.103 |
| 45.4 | -0.057 |
| 45.42 | -0.002 |
| 45.44 | 0.045 |
| 45.46 | 0.069 |
| 45.48 | 0.072 |
| 45.5 | 0.067 |
| 45.52 | 0.057 |
| 45.54 | 0.041 |
| 45.56 | 0.017 |
| 45.58 | -0.018 |
| 45.6 | -0.06 |
| 45.62 | -0.102 |
| 45.64 | -0.143 |
| 45.66 | -0.18 |
| 45.68 | -0.212 |
| 45.7 | -0.239 |
| 45.72 | -0.259 |
| 45.74 | -0.274 |
| 45.76 | -0.284 |
| 45.78 | -0.29 |
| 45.8 | -0.294 |
| 45.82 | -0.296 |
| 45.84 | -0.297 |
| 45.86 | -0.298 |
| 45.88 | -0.298 |
| 45.9 | -0.298 |
| 45.92 | -0.298 |
| 45.94 | -0.297 |
| 45.96 | -0.297 |
| 45.98 | -0.297 |
| 46.0 | -0.297 |
| 46.02 | -0.297 |
| 46.04 | -0.296 |
| 46.06 | -0.296 |
| 46.08 | -0.296 |
| 46.1 | -0.295 |
| 46.12 | -0.295 |
| 46.14 | -0.295 |
| 46.16 | -0.294 |
| 46.18 | -0.294 |
| 46.2 | -0.294 |
| 46.22 | -0.293 |
| 46.24 | -0.293 |
| 46.26 | -0.292 |
| 46.28 | -0.292 |
| 46.3 | -0.291 |
| 46.32 | -0.29 |
| 46.34 | -0.29 |
| 46.36 | -0.289 |
| 46.38 | -0.288 |
| 46.4 | -0.287 |
| 46.42 | -0.286 |
| 46.44 | -0.285 |
| 46.46 | -0.284 |
| 46.48 | -0.283 |
| 46.5 | -0.281 |
| 46.52 | -0.279 |
| 46.54 | -0.276 |
| 46.56 | -0.273 |
| 46.58 | -0.267 |
| 46.6 | -0.258 |
| 46.62 | -0.245 |
| 46.64 | -0.224 |
| 46.66 | -0.191 |
| 46.68 | -0.142 |
| 46.7 | -0.07 |
| 46.72 | 0.032 |
| 46.74 | 0.172 |
| 46.76 | 0.358 |
| 46.78 | 0.594 |
| 46.8 | 0.883 |
| 46.82 | 1.222 |
| 46.84 | 1.603 |
| 46.86 | 2.01 |
| 46.88 | 2.425 |
| 46.9 | 2.821 |
| 46.92 | 3.174 |
| 46.94 | 3.457 |
| 46.96 | 3.642 |
| 46.98 | 3.518 |
| 47.0 | 3.17 |
| 47.02 | 2.81 |
| 47.04 | 2.519 |
| 47.06 | 2.291 |
| 47.08 | 2.092 |
| 47.1 | 1.813 |
| 47.12 | 1.443 |
| 47.14 | 1.09 |
| 47.16 | 0.804 |
| 47.18 | 0.587 |
| 47.2 | 0.424 |
| 47.22 | 0.301 |
| 47.24 | 0.206 |
| 47.26 | 0.132 |
| 47.28 | 0.074 |
| 47.3 | 0.026 |
| 47.32 | -0.012 |
| 47.34 | -0.043 |
| 47.36 | -0.069 |
| 47.38 | -0.091 |
| 47.4 | -0.109 |
| 47.42 | -0.125 |
| 47.44 | -0.138 |
| 47.46 | -0.15 |
| 47.48 | -0.159 |
| 47.5 | -0.167 |
| 47.52 | -0.175 |
| 47.54 | -0.181 |
| 47.56 | -0.186 |
| 47.58 | -0.191 |
| 47.6 | -0.195 |
| 47.62 | -0.198 |
| 47.64 | -0.201 |
| 47.66 | -0.203 |
| 47.68 | -0.204 |
| 47.7 | -0.206 |
| 47.72 | -0.206 |
| 47.74 | -0.207 |
| 47.76 | -0.206 |
| 47.78 | -0.206 |
| 47.8 | -0.205 |
| 47.82 | -0.203 |
| 47.84 | -0.201 |
| 47.86 | -0.198 |
| 47.88 | -0.195 |
| 47.9 | -0.191 |
| 47.92 | -0.186 |
| 47.94 | -0.18 |
| 47.96 | -0.172 |
| 47.98 | -0.164 |
| 48.0 | -0.154 |
| 48.02 | -0.142 |
| 48.04 | -0.128 |
| 48.06 | -0.11 |
| 48.08 | -0.089 |
| 48.1 | -0.064 |
| 48.12 | -0.032 |
| 48.14 | 0.007 |
| 48.16 | 0.056 |
| 48.18 | 0.119 |
| 48.2 | 0.199 |
| 48.22 | 0.303 |
| 48.24 | 0.441 |
| 48.26 | 0.622 |
| 48.28 | 0.848 |
| 48.3 | 1.098 |
| 48.32 | 1.309 |
| 48.34 | 1.398 |
| 48.36 | 1.36 |
| 48.38 | 1.237 |
| 48.4 | 1.078 |
| 48.42 | 0.931 |
| 48.44 | 0.813 |
| 48.46 | 0.699 |
| 48.48 | 0.568 |
| 48.5 | 0.423 |
| 48.52 | 0.272 |
| 48.54 | 0.129 |
| 48.56 | 0.006 |
| 48.58 | -0.085 |
| 48.6 | -0.145 |
| 48.62 | -0.178 |
| 48.64 | -0.192 |
| 48.66 | -0.191 |
| 48.68 | -0.182 |
| 48.7 | -0.167 |
| 48.72 | -0.145 |
| 48.74 | -0.116 |
| 48.76 | -0.077 |
| 48.78 | -0.026 |
| 48.8 | 0.042 |
| 48.82 | 0.131 |
| 48.84 | 0.232 |
| 48.86 | 0.322 |
| 48.88 | 0.362 |
| 48.9 | 0.346 |
| 48.92 | 0.291 |
| 48.94 | 0.222 |
| 48.96 | 0.16 |
| 48.98 | 0.116 |
| 49.0 | 0.078 |
| 49.02 | 0.033 |
| 49.04 | -0.022 |
| 49.06 | -0.082 |
| 49.08 | -0.141 |
| 49.1 | -0.191 |
| 49.12 | -0.23 |
| 49.14 | -0.255 |
| 49.16 | -0.27 |
| 49.18 | -0.278 |
| 49.2 | -0.282 |
| 49.22 | -0.283 |
| 49.24 | -0.282 |
| 49.26 | -0.279 |
| 49.28 | -0.272 |
| 49.3 | -0.257 |
| 49.32 | -0.23 |
| 49.34 | -0.185 |
| 49.36 | -0.122 |
| 49.38 | -0.044 |
| 49.4 | 0.039 |
| 49.42 | 0.112 |
| 49.44 | 0.163 |
| 49.46 | 0.159 |
| 49.48 | 0.086 |
| 49.5 | 0.058 |
| 49.52 | 0.12 |
| 49.54 | 0.262 |
| 49.56 | 0.461 |
| 49.58 | 0.704 |
| 49.6 | 0.958 |
| 49.62 | 1.249 |
| 49.64 | 1.601 |
| 49.66 | 1.998 |
| 49.68 | 2.395 |
| 49.7 | 2.753 |
| 49.72 | 3.036 |
| 49.74 | 3.213 |
| 49.76 | 3.045 |
| 49.78 | 2.608 |
| 49.8 | 2.137 |
| 49.82 | 1.771 |
| 49.84 | 1.54 |
| 49.86 | 1.401 |
| 49.88 | 1.256 |
| 49.9 | 0.966 |
| 49.92 | 0.616 |
| 49.94 | 0.3 |
| 49.96 | 0.069 |
| 49.98 | -0.074 |
| 50.0 | -0.152 |
| 50.02 | -0.192 |
| 50.04 | -0.213 |
| 50.06 | -0.225 |
| 50.08 | -0.234 |
| 50.1 | -0.24 |
| 50.12 | -0.245 |
| 50.14 | -0.249 |
| 50.16 | -0.252 |
| 50.18 | -0.255 |
| 50.2 | -0.258 |
| 50.22 | -0.26 |
| 50.24 | -0.261 |
| 50.26 | -0.263 |
| 50.28 | -0.264 |
| 50.3 | -0.265 |
| 50.32 | -0.266 |
| 50.34 | -0.266 |
| 50.36 | -0.263 |
| 50.38 | -0.248 |
| 50.4 | -0.202 |
| 50.42 | -0.112 |
| 50.44 | -0.022 |
| 50.46 | -0.017 |
| 50.48 | -0.127 |
| 50.5 | -0.16 |
| 50.52 | -0.109 |
| 50.54 | -0.003 |
| 50.56 | 0.156 |
| 50.58 | 0.341 |
| 50.6 | 0.507 |
| 50.62 | 0.681 |
| 50.64 | 0.929 |
| 50.66 | 1.219 |
| 50.68 | 1.518 |
| 50.7 | 1.8 |
| 50.72 | 2.046 |
| 50.74 | 2.237 |
| 50.76 | 2.345 |
| 50.78 | 2.27 |
| 50.8 | 2.058 |
| 50.82 | 1.792 |
| 50.84 | 1.538 |
| 50.86 | 1.325 |
| 50.88 | 1.156 |
| 50.9 | 0.999 |
| 50.92 | 0.798 |
| 50.94 | 0.573 |
| 50.96 | 0.357 |
| 50.98 | 0.173 |
| 51.0 | 0.033 |
| 51.02 | -0.063 |
| 51.04 | -0.124 |
| 51.06 | -0.16 |
| 51.08 | -0.179 |
| 51.1 | -0.189 |
| 51.12 | -0.194 |
| 51.14 | -0.196 |
| 51.16 | -0.196 |
| 51.18 | -0.194 |
| 51.2 | -0.19 |
| 51.22 | -0.185 |
| 51.24 | -0.178 |
| 51.26 | -0.168 |
| 51.28 | -0.155 |
| 51.3 | -0.138 |
| 51.32 | -0.114 |
| 51.34 | -0.079 |
| 51.36 | -0.027 |
| 51.38 | 0.051 |
| 51.4 | 0.167 |
| 51.42 | 0.331 |
| 51.44 | 0.551 |
| 51.46 | 0.824 |
| 51.48 | 1.133 |
| 51.5 | 1.433 |
| 51.52 | 1.652 |
| 51.54 | 1.718 |
| 51.56 | 1.608 |
| 51.58 | 1.405 |
| 51.6 | 1.204 |
| 51.62 | 1.057 |
| 51.64 | 0.965 |
| 51.66 | 0.891 |
| 51.68 | 0.785 |
| 51.7 | 0.621 |
| 51.72 | 0.429 |
| 51.74 | 0.245 |
| 51.76 | 0.092 |
| 51.78 | -0.023 |
| 51.8 | -0.102 |
| 51.82 | -0.151 |
| 51.84 | -0.181 |
| 51.86 | -0.198 |
| 51.88 | -0.209 |
| 51.9 | -0.217 |
| 51.92 | -0.221 |
| 51.94 | -0.224 |
| 51.96 | -0.226 |
| 51.98 | -0.226 |
| 52.0 | -0.225 |
| 52.02 | -0.223 |
| 52.04 | -0.22 |
| 52.06 | -0.215 |
| 52.08 | -0.208 |
| 52.1 | -0.197 |
| 52.12 | -0.181 |
| 52.14 | -0.156 |
| 52.16 | -0.116 |
| 52.18 | -0.054 |
| 52.2 | 0.038 |
| 52.22 | 0.169 |
| 52.24 | 0.342 |
| 52.26 | 0.554 |
| 52.28 | 0.788 |
| 52.3 | 1.014 |
| 52.32 | 1.185 |
| 52.34 | 1.255 |
| 52.36 | 1.226 |
| 52.38 | 1.13 |
| 52.4 | 1.007 |
| 52.42 | 0.889 |
| 52.44 | 0.788 |
| 52.46 | 0.696 |
| 52.48 | 0.593 |
| 52.5 | 0.47 |
| 52.52 | 0.334 |
| 52.54 | 0.195 |
| 52.56 | 0.066 |
| 52.58 | -0.043 |
| 52.6 | -0.127 |
| 52.62 | -0.187 |
| 52.64 | -0.227 |
| 52.66 | -0.252 |
| 52.68 | -0.267 |
| 52.7 | -0.275 |
| 52.72 | -0.281 |
| 52.74 | -0.284 |
| 52.76 | -0.286 |
| 52.78 | -0.288 |
| 52.8 | -0.289 |
| 52.82 | -0.29 |
| 52.84 | -0.29 |
| 52.86 | -0.291 |
| 52.88 | -0.291 |
| 52.9 | -0.291 |
| 52.92 | -0.291 |
| 52.94 | -0.29 |
| 52.96 | -0.289 |
| 52.98 | -0.288 |
| 53.0 | -0.287 |
| 53.02 | -0.285 |
| 53.04 | -0.283 |
| 53.06 | -0.28 |
| 53.08 | -0.277 |
| 53.1 | -0.272 |
| 53.12 | -0.265 |
| 53.14 | -0.255 |
| 53.16 | -0.24 |
| 53.18 | -0.218 |
| 53.2 | -0.183 |
| 53.22 | -0.132 |
| 53.24 | -0.06 |
| 53.26 | 0.037 |
| 53.28 | 0.161 |
| 53.3 | 0.308 |
| 53.32 | 0.472 |
| 53.34 | 0.638 |
| 53.36 | 0.788 |
| 53.38 | 0.899 |
| 53.4 | 0.954 |
| 53.42 | 0.939 |
| 53.44 | 0.867 |
| 53.46 | 0.763 |
| 53.48 | 0.652 |
| 53.5 | 0.55 |
| 53.52 | 0.46 |
| 53.54 | 0.376 |
| 53.56 | 0.286 |
| 53.58 | 0.186 |
| 53.6 | 0.081 |
| 53.62 | -0.019 |
| 53.64 | -0.104 |
| 53.66 | -0.17 |
| 53.68 | -0.215 |
| 53.7 | -0.24 |
| 53.72 | -0.25 |
| 53.74 | -0.249 |
| 53.76 | -0.241 |
| 53.78 | -0.227 |
| 53.8 | -0.21 |
| 53.82 | -0.189 |
| 53.84 | -0.165 |
| 53.86 | -0.139 |
| 53.88 | -0.109 |
| 53.9 | -0.078 |
| 53.92 | -0.044 |
| 53.94 | -0.009 |
| 53.96 | 0.027 |
| 53.98 | 0.064 |
| 54.0 | 0.099 |
| 54.02 | 0.132 |
| 54.04 | 0.163 |
| 54.06 | 0.189 |
| 54.08 | 0.21 |
| 54.1 | 0.224 |
| 54.12 | 0.232 |
| 54.14 | 0.231 |
| 54.16 | 0.223 |
| 54.18 | 0.208 |
| 54.2 | 0.186 |
| 54.22 | 0.158 |
| 54.24 | 0.126 |
| 54.26 | 0.089 |
| 54.28 | 0.05 |
| 54.3 | 0.01 |
| 54.32 | -0.031 |
| 54.34 | -0.072 |
| 54.36 | -0.11 |
| 54.38 | -0.147 |
| 54.4 | -0.181 |
| 54.42 | -0.211 |
| 54.44 | -0.239 |
| 54.46 | -0.262 |
| 54.48 | -0.283 |
| 54.5 | -0.3 |
| 54.52 | -0.314 |
| 54.54 | -0.326 |
| 54.56 | -0.335 |
| 54.58 | -0.343 |
| 54.6 | -0.349 |
| 54.62 | -0.353 |
| 54.64 | -0.357 |
| 54.66 | -0.36 |
| 54.68 | -0.362 |
| 54.7 | -0.363 |
| 54.72 | -0.364 |
| 54.74 | -0.365 |
| 54.76 | -0.366 |
| 54.78 | -0.367 |
| 54.8 | -0.367 |
| 54.82 | -0.368 |
| 54.84 | -0.368 |
| 54.86 | -0.369 |
| 54.88 | -0.369 |
| 54.9 | -0.37 |
| 54.92 | -0.37 |
| 54.94 | -0.371 |
| 54.96 | -0.371 |
| 54.98 | -0.371 |
| 55.0 | -0.372 |
| 55.02 | -0.372 |
| 55.04 | -0.373 |
| 55.06 | -0.373 |
| 55.08 | -0.374 |
| 55.1 | -0.374 |
| 55.12 | -0.375 |
| 55.14 | -0.375 |
| 55.16 | -0.375 |
| 55.18 | -0.376 |
| 55.2 | -0.376 |
| 55.22 | -0.377 |
| 55.24 | -0.377 |
| 55.26 | -0.377 |
| 55.28 | -0.378 |
| 55.3 | -0.378 |
| 55.32 | -0.378 |
| 55.34 | -0.379 |
| 55.36 | -0.379 |
| 55.38 | -0.38 |
| 55.4 | -0.38 |
| 55.42 | -0.38 |
| 55.44 | -0.381 |
| 55.46 | -0.381 |
| 55.48 | -0.381 |
| 55.5 | -0.382 |
| 55.52 | -0.382 |
| 55.54 | -0.382 |
| 55.56 | -0.383 |
| 55.58 | -0.383 |
| 55.6 | -0.383 |
| 55.62 | -0.384 |
| 55.64 | -0.384 |
| 55.66 | -0.384 |
| 55.68 | -0.384 |
| 55.7 | -0.385 |
| 55.72 | -0.385 |
| 55.74 | -0.385 |
| 55.76 | -0.385 |
| 55.78 | -0.386 |
| 55.8 | -0.385 |
| 55.82 | -0.385 |
| 55.84 | -0.383 |
| 55.86 | -0.379 |
| 55.88 | -0.372 |
| 55.9 | -0.359 |
| 55.92 | -0.338 |
| 55.94 | -0.304 |
| 55.96 | -0.256 |
| 55.98 | -0.19 |
| 56.0 | -0.107 |
| 56.02 | -0.01 |
| 56.04 | 0.094 |
| 56.06 | 0.195 |
| 56.08 | 0.283 |
| 56.1 | 0.348 |
| 56.12 | 0.384 |
| 56.14 | 0.385 |
| 56.16 | 0.354 |
| 56.18 | 0.303 |
| 56.2 | 0.242 |
| 56.22 | 0.181 |
| 56.24 | 0.125 |
| 56.26 | 0.072 |
| 56.28 | 0.019 |
| 56.3 | -0.038 |
| 56.32 | -0.1 |
| 56.34 | -0.163 |
| 56.36 | -0.221 |
| 56.38 | -0.273 |
| 56.4 | -0.313 |
| 56.42 | -0.343 |
| 56.44 | -0.363 |
| 56.46 | -0.376 |
| 56.48 | -0.383 |
| 56.5 | -0.387 |
| 56.52 | -0.389 |
| 56.54 | -0.39 |
| 56.56 | -0.39 |
| 56.58 | -0.39 |
| 56.6 | -0.39 |
| 56.62 | -0.39 |
| 56.64 | -0.39 |
| 56.66 | -0.389 |
| 56.68 | -0.389 |
| 56.7 | -0.389 |
| 56.72 | -0.389 |
| 56.74 | -0.388 |
| 56.76 | -0.388 |
| 56.78 | -0.387 |
| 56.8 | -0.387 |
| 56.82 | -0.386 |
| 56.84 | -0.386 |
| 56.86 | -0.385 |
| 56.88 | -0.384 |
| 56.9 | -0.383 |
| 56.92 | -0.382 |
| 56.94 | -0.381 |
| 56.96 | -0.38 |
| 56.98 | -0.378 |
| 57.0 | -0.377 |
| 57.02 | -0.374 |
| 57.04 | -0.372 |
| 57.06 | -0.369 |
| 57.08 | -0.364 |
| 57.1 | -0.359 |
| 57.12 | -0.352 |
| 57.14 | -0.342 |
| 57.16 | -0.33 |
| 57.18 | -0.314 |
| 57.2 | -0.294 |
| 57.22 | -0.27 |
| 57.24 | -0.24 |
| 57.26 | -0.206 |
| 57.28 | -0.168 |
| 57.3 | -0.128 |
| 57.32 | -0.086 |
| 57.34 | -0.048 |
| 57.36 | -0.016 |
| 57.38 | 0.006 |
| 57.4 | -0.004 |
| 57.42 | -0.059 |
| 57.44 | -0.122 |
| 57.46 | -0.167 |
| 57.48 | -0.192 |
| 57.5 | -0.201 |
| 57.52 | -0.204 |
| 57.54 | -0.207 |
| 57.56 | -0.229 |
| 57.58 | -0.27 |
| 57.6 | -0.31 |
| 57.62 | -0.341 |
| 57.64 | -0.361 |
| 57.66 | -0.372 |
| 57.68 | -0.378 |
| 57.7 | -0.381 |
| 57.72 | -0.383 |
| 57.74 | -0.384 |
| 57.76 | -0.385 |
| 57.78 | -0.386 |
| 57.8 | -0.387 |
| 57.82 | -0.387 |
| 57.84 | -0.387 |
| 57.86 | -0.388 |
| 57.88 | -0.388 |
| 57.9 | -0.388 |
| 57.92 | -0.388 |
| 57.94 | -0.388 |
| 57.96 | -0.388 |
| 57.98 | -0.388 |
| 58.0 | -0.387 |
| 58.02 | -0.387 |
| 58.04 | -0.387 |
| 58.06 | -0.387 |
| 58.08 | -0.387 |
| 58.1 | -0.387 |
| 58.12 | -0.386 |
| 58.14 | -0.386 |
| 58.16 | -0.386 |
| 58.18 | -0.386 |
| 58.2 | -0.385 |
| 58.22 | -0.385 |
| 58.24 | -0.385 |
| 58.26 | -0.384 |
| 58.28 | -0.384 |
| 58.3 | -0.384 |
| 58.32 | -0.383 |
| 58.34 | -0.383 |
| 58.36 | -0.383 |
| 58.38 | -0.382 |
| 58.4 | -0.382 |
| 58.42 | -0.381 |
| 58.44 | -0.381 |
| 58.46 | -0.38 |
| 58.48 | -0.38 |
| 58.5 | -0.379 |
| 58.52 | -0.379 |
| 58.54 | -0.378 |
| 58.56 | -0.378 |
| 58.58 | -0.377 |
| 58.6 | -0.376 |
| 58.62 | -0.376 |
| 58.64 | -0.375 |
| 58.66 | -0.374 |
| 58.68 | -0.373 |
| 58.7 | -0.372 |
| 58.72 | -0.371 |
| 58.74 | -0.369 |
| 58.76 | -0.368 |
| 58.78 | -0.366 |
| 58.8 | -0.364 |
| 58.82 | -0.361 |
| 58.84 | -0.358 |
| 58.86 | -0.353 |
| 58.88 | -0.347 |
| 58.9 | -0.338 |
| 58.92 | -0.324 |
| 58.94 | -0.303 |
| 58.96 | -0.273 |
| 58.98 | -0.236 |
| 59.0 | -0.206 |
| 59.02 | -0.205 |
| 59.04 | -0.224 |
| 59.06 | -0.253 |
| 59.08 | -0.281 |
| 59.1 | -0.298 |
| 59.12 | -0.302 |
| 59.14 | -0.293 |
| 59.16 | -0.283 |
| 59.18 | -0.284 |
| 59.2 | -0.295 |
| 59.22 | -0.31 |
| 59.24 | -0.327 |
| 59.26 | -0.34 |
| 59.28 | -0.348 |
| 59.3 | -0.352 |
| 59.32 | -0.353 |
| 59.34 | -0.353 |
| 59.36 | -0.352 |
| 59.38 | -0.351 |
| 59.4 | -0.349 |
| 59.42 | -0.348 |
| 59.44 | -0.346 |
| 59.46 | -0.345 |
| 59.48 | -0.343 |
| 59.5 | -0.341 |
| 59.52 | -0.339 |
| 59.54 | -0.337 |
| 59.56 | -0.334 |
| 59.58 | -0.332 |
| 59.6 | -0.329 |
| 59.62 | -0.326 |
| 59.64 | -0.323 |
| 59.66 | -0.319 |
| 59.68 | -0.316 |
| 59.7 | -0.311 |
| 59.72 | -0.307 |
| 59.74 | -0.302 |
| 59.76 | -0.296 |
| 59.78 | -0.29 |
| 59.8 | -0.282 |
| 59.82 | -0.274 |
| 59.84 | -0.265 |
| 59.86 | -0.254 |
| 59.88 | -0.242 |
| 59.9 | -0.228 |
| 59.92 | -0.211 |
| 59.94 | -0.191 |
| 59.96 | -0.167 |
| 59.98 | -0.139 |
| 60.0 | -0.106 |
| 60.02 | -0.067 |
| 60.04 | -0.026 |
| 60.06 | 0.017 |
| 60.08 | 0.057 |
| 60.1 | 0.094 |
| 60.12 | 0.135 |
| 60.14 | 0.2 |
| 60.16 | 0.315 |
| 60.18 | 0.484 |
| 60.2 | 0.654 |
| 60.22 | 0.716 |
| 60.24 | 0.659 |
| 60.26 | 0.52 |
| 60.28 | 0.349 |
| 60.3 | 0.199 |
| 60.32 | 0.111 |
| 60.34 | 0.099 |
| 60.36 | 0.135 |
| 60.38 | 0.155 |
| 60.4 | 0.126 |
| 60.42 | 0.061 |
| 60.44 | -0.021 |
| 60.46 | -0.099 |
| 60.48 | -0.155 |
| 60.5 | -0.183 |
| 60.52 | -0.187 |
| 60.54 | -0.173 |
| 60.56 | -0.152 |
| 60.58 | -0.13 |
| 60.6 | -0.105 |
| 60.62 | -0.054 |
| 60.64 | 0.048 |
| 60.66 | 0.161 |
| 60.68 | 0.178 |
| 60.7 | 0.102 |
| 60.72 | -0.016 |
| 60.74 | -0.122 |
| 60.76 | -0.188 |
| 60.78 | -0.209 |
| 60.8 | -0.184 |
| 60.82 | -0.133 |
| 60.84 | -0.111 |
| 60.86 | -0.143 |
| 60.88 | -0.204 |
| 60.9 | -0.267 |
| 60.92 | -0.311 |
| 60.94 | -0.335 |
| 60.96 | -0.345 |
| 60.98 | -0.348 |
| 61.0 | -0.349 |
| 61.02 | -0.349 |
| 61.04 | -0.349 |
| 61.06 | -0.348 |
| 61.08 | -0.348 |
| 61.1 | -0.348 |
| 61.12 | -0.348 |
| 61.14 | -0.347 |
| 61.16 | -0.347 |
| 61.18 | -0.347 |
| 61.2 | -0.347 |
| 61.22 | -0.346 |
| 61.24 | -0.346 |
| 61.26 | -0.346 |
| 61.28 | -0.346 |
| 61.3 | -0.345 |
| 61.32 | -0.345 |
| 61.34 | -0.345 |
| 61.36 | -0.345 |
| 61.38 | -0.344 |
| 61.4 | -0.344 |
| 61.42 | -0.344 |
| 61.44 | -0.344 |
| 61.46 | -0.343 |
| 61.48 | -0.343 |
| 61.5 | -0.343 |
| 61.52 | -0.342 |
| 61.54 | -0.341 |
| 61.56 | -0.339 |
| 61.58 | -0.335 |
| 61.6 | -0.329 |
| 61.62 | -0.318 |
| 61.64 | -0.3 |
| 61.66 | -0.272 |
| 61.68 | -0.231 |
| 61.7 | -0.175 |
| 61.72 | -0.101 |
| 61.74 | -0.012 |
| 61.76 | 0.091 |
| 61.78 | 0.199 |
| 61.8 | 0.305 |
| 61.82 | 0.398 |
| 61.84 | 0.47 |
| 61.86 | 0.515 |
| 61.88 | 0.506 |
| 61.9 | 0.43 |
| 61.92 | 0.32 |
| 61.94 | 0.214 |
| 61.96 | 0.138 |
| 61.98 | 0.095 |
| 62.0 | 0.078 |
| 62.02 | 0.07 |
| 62.04 | 0.057 |
| 62.06 | 0.013 |
| 62.08 | -0.059 |
| 62.1 | -0.14 |
| 62.12 | -0.212 |
| 62.14 | -0.266 |
| 62.16 | -0.3 |
| 62.18 | -0.32 |
| 62.2 | -0.329 |
| 62.22 | -0.332 |
| 62.24 | -0.333 |
| 62.26 | -0.334 |
| 62.28 | -0.333 |
| 62.3 | -0.333 |
| 62.32 | -0.333 |
| 62.34 | -0.332 |
| 62.36 | -0.332 |
| 62.38 | -0.332 |
| 62.4 | -0.331 |
| 62.42 | -0.331 |
| 62.44 | -0.33 |
| 62.46 | -0.33 |
| 62.48 | -0.329 |
| 62.5 | -0.329 |
| 62.52 | -0.328 |
| 62.54 | -0.327 |
| 62.56 | -0.327 |
| 62.58 | -0.326 |
| 62.6 | -0.325 |
| 62.62 | -0.324 |
| 62.64 | -0.323 |
| 62.66 | -0.322 |
| 62.68 | -0.319 |
| 62.7 | -0.318 |
| 62.72 | -0.316 |
| 62.74 | -0.314 |
| 62.76 | -0.312 |
| 62.78 | -0.31 |
| 62.8 | -0.307 |
| 62.82 | -0.304 |
| 62.84 | -0.3 |
| 62.86 | -0.295 |
| 62.88 | -0.29 |
| 62.9 | -0.284 |
| 62.92 | -0.277 |
| 62.94 | -0.268 |
| 62.96 | -0.257 |
| 62.98 | -0.243 |
| 63.0 | -0.225 |
| 63.02 | -0.201 |
| 63.04 | -0.166 |
| 63.06 | -0.115 |
| 63.08 | -0.037 |
| 63.1 | 0.08 |
| 63.12 | 0.247 |
| 63.14 | 0.467 |
| 63.16 | 0.708 |
| 63.18 | 0.873 |
| 63.2 | 0.887 |
| 63.22 | 0.85 |
| 63.24 | 0.781 |
| 63.26 | 0.696 |
| 63.28 | 0.617 |
| 63.3 | 0.56 |
| 63.32 | 0.536 |
| 63.34 | 0.53 |
| 63.36 | 0.49 |
| 63.38 | 0.404 |
| 63.4 | 0.315 |
| 63.42 | 0.224 |
| 63.44 | 0.134 |
| 63.46 | 0.047 |
| 63.48 | -0.033 |
| 63.5 | -0.102 |
| 63.52 | -0.16 |
| 63.54 | -0.205 |
| 63.56 | -0.236 |
| 63.58 | -0.256 |
| 63.6 | -0.262 |
| 63.62 | -0.247 |
| 63.64 | -0.164 |
| 63.66 | 0.018 |
| 63.68 | -0.016 |
| 63.7 | -0.135 |
| 63.72 | -0.234 |
| 63.74 | -0.276 |
| 63.76 | -0.282 |
| 63.78 | -0.274 |
| 63.8 | -0.254 |
| 63.82 | -0.194 |
| 63.84 | -0.105 |
| 63.86 | -0.128 |
| 63.88 | -0.18 |
| 63.9 | -0.215 |
| 63.92 | -0.221 |
| 63.94 | -0.209 |
| 63.96 | -0.189 |
| 63.98 | -0.164 |
| 64.0 | -0.133 |
| 64.02 | -0.095 |
| 64.04 | -0.048 |
| 64.06 | 0.008 |
| 64.08 | 0.075 |
| 64.1 | 0.153 |
| 64.12 | 0.242 |
| 64.14 | 0.338 |
| 64.16 | 0.436 |
| 64.18 | 0.526 |
| 64.2 | 0.596 |
| 64.22 | 0.635 |
| 64.24 | 0.657 |
| 64.26 | 0.674 |
| 64.28 | 0.687 |
| 64.3 | 0.697 |
| 64.32 | 0.703 |
| 64.34 | 0.703 |
| 64.36 | 0.693 |
| 64.38 | 0.667 |
| 64.4 | 0.621 |
| 64.42 | 0.565 |
| 64.44 | 0.505 |
| 64.46 | 0.442 |
| 64.48 | 0.377 |
| 64.5 | 0.312 |
| 64.52 | 0.248 |
| 64.54 | 0.186 |
| 64.56 | 0.126 |
| 64.58 | 0.07 |
| 64.6 | 0.017 |
| 64.62 | -0.032 |
| 64.64 | -0.076 |
| 64.66 | -0.116 |
| 64.68 | -0.151 |
| 64.7 | -0.182 |
| 64.72 | -0.208 |
| 64.74 | -0.231 |
| 64.76 | -0.249 |
| 64.78 | -0.264 |
| 64.8 | -0.276 |
| 64.82 | -0.285 |
| 64.84 | -0.291 |
| 64.86 | -0.294 |
| 64.88 | -0.295 |
| 64.9 | -0.294 |
| 64.92 | -0.29 |
| 64.94 | -0.284 |
| 64.96 | -0.276 |
| 64.98 | -0.264 |
| 65.0 | -0.25 |
| 65.02 | -0.23 |
| 65.04 | -0.205 |
| 65.06 | -0.172 |
| 65.08 | -0.129 |
| 65.1 | -0.073 |
| 65.12 | -0.001 |
| 65.14 | 0.081 |
| 65.16 | 0.16 |
| 65.18 | 0.228 |
| 65.2 | 0.326 |
| 65.22 | 0.558 |
| 65.24 | 0.916 |
| 65.26 | 1.039 |
| 65.28 | 0.989 |
| 65.3 | 0.878 |
| 65.32 | 0.744 |
| 65.34 | 0.608 |
| 65.36 | 0.483 |
| 65.38 | 0.393 |
| 65.4 | 0.388 |
| 65.42 | 0.477 |
| 65.44 | 0.485 |
| 65.46 | 0.407 |
| 65.48 | 0.305 |
| 65.5 | 0.196 |
| 65.52 | 0.091 |
| 65.54 | -0.001 |
| 65.56 | -0.079 |
| 65.58 | -0.142 |
| 65.6 | -0.191 |
| 65.62 | -0.229 |
| 65.64 | -0.257 |
| 65.66 | -0.279 |
| 65.68 | -0.296 |
| 65.7 | -0.309 |
| 65.72 | -0.32 |
| 65.74 | -0.328 |
| 65.76 | -0.336 |
| 65.78 | -0.342 |
| 65.8 | -0.348 |
| 65.82 | -0.353 |
| 65.84 | -0.357 |
| 65.86 | -0.361 |
| 65.88 | -0.365 |
| 65.9 | -0.368 |
| 65.92 | -0.371 |
| 65.94 | -0.374 |
| 65.96 | -0.376 |
| 65.98 | -0.379 |
| 66.0 | -0.381 |
| 66.02 | -0.383 |
| 66.04 | -0.385 |
| 66.06 | -0.386 |
| 66.08 | -0.388 |
| 66.1 | -0.39 |
| 66.12 | -0.391 |
| 66.14 | -0.393 |
| 66.16 | -0.394 |
| 66.18 | -0.395 |
| 66.2 | -0.396 |
| 66.22 | -0.398 |
| 66.24 | -0.399 |
| 66.26 | -0.4 |
| 66.28 | -0.401 |
| 66.3 | -0.401 |
| 66.32 | -0.402 |
| 66.34 | -0.402 |
| 66.36 | -0.402 |
| 66.38 | -0.4 |
| 66.4 | -0.396 |
| 66.42 | -0.39 |
| 66.44 | -0.38 |
| 66.46 | -0.365 |
| 66.48 | -0.345 |
| 66.5 | -0.319 |
| 66.52 | -0.288 |
| 66.54 | -0.253 |
| 66.56 | -0.216 |
| 66.58 | -0.181 |
| 66.6 | -0.15 |
| 66.62 | -0.128 |
| 66.64 | -0.114 |
| 66.66 | -0.131 |
| 66.68 | -0.185 |
| 66.7 | -0.247 |
| 66.72 | -0.289 |
| 66.74 | -0.306 |
| 66.76 | -0.304 |
| 66.78 | -0.295 |
| 66.8 | -0.286 |
| 66.82 | -0.281 |
| 66.84 | -0.286 |
| 66.86 | -0.314 |
| 66.88 | -0.352 |
| 66.9 | -0.386 |
| 66.92 | -0.408 |
| 66.94 | -0.418 |
| 66.96 | -0.423 |
| 66.98 | -0.425 |
| 67.0 | -0.425 |
| 67.02 | -0.426 |
| 67.04 | -0.426 |
| 67.06 | -0.427 |
| 67.08 | -0.427 |
| 67.1 | -0.428 |
| 67.12 | -0.428 |
| 67.14 | -0.429 |
| 67.16 | -0.429 |
| 67.18 | -0.43 |
| 67.2 | -0.43 |
| 67.22 | -0.43 |
| 67.24 | -0.431 |
| 67.26 | -0.431 |
| 67.28 | -0.432 |
| 67.3 | -0.432 |
| 67.32 | -0.433 |
| 67.34 | -0.433 |
| 67.36 | -0.433 |
| 67.38 | -0.434 |
| 67.4 | -0.434 |
| 67.42 | -0.435 |
| 67.44 | -0.435 |
| 67.46 | -0.435 |
| 67.48 | -0.436 |
| 67.5 | -0.436 |
| 67.52 | -0.436 |
| 67.54 | -0.437 |
| 67.56 | -0.437 |
| 67.58 | -0.437 |
| 67.6 | -0.438 |
| 67.62 | -0.438 |
| 67.64 | -0.438 |
| 67.66 | -0.439 |
| 67.68 | -0.439 |
| 67.7 | -0.439 |
| 67.72 | -0.439 |
| 67.74 | -0.44 |
| 67.76 | -0.44 |
| 67.78 | -0.44 |
| 67.8 | -0.441 |
| 67.82 | -0.441 |
| 67.84 | -0.441 |
| 67.86 | -0.441 |
| 67.88 | -0.442 |
| 67.9 | -0.442 |
| 67.92 | -0.442 |
| 67.94 | -0.442 |
| 67.96 | -0.443 |
| 67.98 | -0.443 |
| 68.0 | -0.443 |
| 68.02 | -0.443 |
| 68.04 | -0.443 |
| 68.06 | -0.444 |
| 68.08 | -0.444 |
| 68.1 | -0.444 |
| 68.12 | -0.444 |
| 68.14 | -0.444 |
| 68.16 | -0.445 |
| 68.18 | -0.445 |
| 68.2 | -0.445 |
| 68.22 | -0.445 |
| 68.24 | -0.445 |
| 68.26 | -0.445 |
| 68.28 | -0.446 |
| 68.3 | -0.446 |
| 68.32 | -0.446 |
| 68.34 | -0.446 |
| 68.36 | -0.446 |
| 68.38 | -0.446 |
| 68.4 | -0.446 |
| 68.42 | -0.446 |
| 68.44 | -0.447 |
| 68.46 | -0.447 |
| 68.48 | -0.447 |
| 68.5 | -0.447 |
| 68.52 | -0.447 |
| 68.54 | -0.447 |
| 68.56 | -0.447 |
| 68.58 | -0.447 |
| 68.6 | -0.447 |
| 68.62 | -0.447 |
| 68.64 | -0.447 |
| 68.66 | -0.447 |
| 68.68 | -0.447 |
| 68.7 | -0.447 |
| 68.72 | -0.447 |
| 68.74 | -0.447 |
| 68.76 | -0.447 |
| 68.78 | -0.447 |
| 68.8 | -0.447 |
| 68.82 | -0.447 |
| 68.84 | -0.447 |
| 68.86 | -0.446 |
| 68.88 | -0.446 |
| 68.9 | -0.446 |
| 68.92 | -0.446 |
| 68.94 | -0.446 |
| 68.96 | -0.446 |
| 68.98 | -0.445 |
| 69.0 | -0.445 |
| 69.02 | -0.445 |
| 69.04 | -0.445 |
| 69.06 | -0.444 |
| 69.08 | -0.444 |
| 69.1 | -0.443 |
| 69.12 | -0.443 |
| 69.14 | -0.443 |
| 69.16 | -0.442 |
| 69.18 | -0.442 |
| 69.2 | -0.441 |
| 69.22 | -0.44 |
| 69.24 | -0.44 |
| 69.26 | -0.439 |
| 69.28 | -0.438 |
| 69.3 | -0.437 |
| 69.32 | -0.436 |
| 69.34 | -0.435 |
| 69.36 | -0.434 |
| 69.38 | -0.433 |
| 69.4 | -0.431 |
| 69.42 | -0.43 |
| 69.44 | -0.428 |
| 69.46 | -0.426 |
| 69.48 | -0.424 |
| 69.5 | -0.421 |
| 69.52 | -0.418 |
| 69.54 | -0.415 |
| 69.56 | -0.412 |
| 69.58 | -0.407 |
| 69.6 | -0.402 |
| 69.62 | -0.397 |
| 69.64 | -0.39 |
| 69.66 | -0.382 |
| 69.68 | -0.373 |
| 69.7 | -0.362 |
| 69.72 | -0.35 |
| 69.74 | -0.336 |
| 69.76 | -0.322 |
| 69.78 | -0.308 |
| 69.8 | -0.293 |
| 69.82 | -0.277 |
| 69.84 | -0.255 |
| 69.86 | -0.223 |
| 69.88 | -0.175 |
| 69.9 | -0.114 |
| 69.92 | -0.057 |
| 69.94 | -0.036 |
| 69.96 | -0.093 |
| 69.98 | -0.173 |
| 70.0 | -0.222 |
| 70.02 | -0.247 |
| 70.04 | -0.262 |
| 70.06 | -0.267 |
| 70.08 | -0.261 |
| 70.1 | -0.246 |
| 70.12 | -0.231 |
| 70.14 | -0.232 |
| 70.16 | -0.271 |
| 70.18 | -0.318 |
| 70.2 | -0.348 |
| 70.22 | -0.366 |
| 70.24 | -0.38 |
| 70.26 | -0.391 |
| 70.28 | -0.401 |
| 70.3 | -0.408 |
| 70.32 | -0.414 |
| 70.34 | -0.419 |
| 70.36 | -0.422 |
| 70.38 | -0.425 |
| 70.4 | -0.427 |
| 70.42 | -0.428 |
| 70.44 | -0.43 |
| 70.46 | -0.431 |
| 70.48 | -0.432 |
| 70.5 | -0.432 |
| 70.52 | -0.433 |
| 70.54 | -0.433 |
| 70.56 | -0.434 |
| 70.58 | -0.434 |
| 70.6 | -0.434 |
| 70.62 | -0.434 |
| 70.64 | -0.434 |
| 70.66 | -0.434 |
| 70.68 | -0.434 |
| 70.7 | -0.434 |
| 70.72 | -0.434 |
| 70.74 | -0.434 |
| 70.76 | -0.433 |
| 70.78 | -0.433 |
| 70.8 | -0.433 |
| 70.82 | -0.433 |
| 70.84 | -0.432 |
| 70.86 | -0.432 |
| 70.88 | -0.431 |
| 70.9 | -0.431 |
| 70.92 | -0.431 |
| 70.94 | -0.43 |
| 70.96 | -0.429 |
| 70.98 | -0.429 |
| 71.0 | -0.428 |
| 71.02 | -0.428 |
| 71.04 | -0.427 |
| 71.06 | -0.426 |
| 71.08 | -0.426 |
| 71.1 | -0.425 |
| 71.12 | -0.424 |
| 71.14 | -0.423 |
| 71.16 | -0.422 |
| 71.18 | -0.421 |
| 71.2 | -0.42 |
| 71.22 | -0.419 |
| 71.24 | -0.418 |
| 71.26 | -0.417 |
| 71.28 | -0.416 |
| 71.3 | -0.414 |
| 71.32 | -0.413 |
| 71.34 | -0.411 |
| 71.36 | -0.409 |
| 71.38 | -0.407 |
| 71.4 | -0.405 |
| 71.42 | -0.402 |
| 71.44 | -0.4 |
| 71.46 | -0.397 |
| 71.48 | -0.393 |
| 71.5 | -0.389 |
| 71.52 | -0.385 |
| 71.54 | -0.379 |
| 71.56 | -0.373 |
| 71.58 | -0.366 |
| 71.6 | -0.357 |
| 71.62 | -0.346 |
| 71.64 | -0.333 |
| 71.66 | -0.316 |
| 71.68 | -0.295 |
| 71.7 | -0.267 |
| 71.72 | -0.231 |
| 71.74 | -0.184 |
| 71.76 | -0.122 |
| 71.78 | -0.046 |
| 71.8 | 0.041 |
| 71.82 | 0.118 |
| 71.84 | 0.156 |
| 71.86 | 0.158 |
| 71.88 | 0.148 |
| 71.9 | 0.128 |
| 71.92 | 0.102 |
| 71.94 | 0.075 |
| 71.96 | 0.05 |
| 71.98 | 0.032 |
| 72.0 | 0.023 |
| 72.02 | 0.016 |
| 72.04 | 0 |
| 72.06 | -0.032 |
| 72.08 | -0.066 |
| 72.1 | -0.101 |
| 72.12 | -0.135 |
| 72.14 | -0.169 |
| 72.16 | -0.201 |
| 72.18 | -0.231 |
| 72.2 | -0.257 |
| 72.22 | -0.279 |
| 72.24 | -0.297 |
| 72.26 | -0.31 |
| 72.28 | -0.318 |
| 72.3 | -0.321 |
| 72.32 | -0.318 |
| 72.34 | -0.307 |
| 72.36 | -0.289 |
| 72.38 | -0.258 |
| 72.4 | -0.212 |
| 72.42 | -0.144 |
| 72.44 | -0.055 |
| 72.46 | 0.034 |
| 72.48 | 0.071 |
| 72.5 | 0.062 |
| 72.52 | 0.034 |
| 72.54 | -0.008 |
| 72.56 | -0.056 |
| 72.58 | -0.102 |
| 72.6 | -0.139 |
| 72.62 | -0.16 |
| 72.64 | -0.16 |
| 72.66 | -0.145 |
| 72.68 | -0.135 |
| 72.7 | -0.15 |
| 72.72 | -0.171 |
| 72.74 | -0.198 |
| 72.76 | -0.228 |
| 72.78 | -0.259 |
| 72.8 | -0.289 |
| 72.82 | -0.315 |
| 72.84 | -0.337 |
| 72.86 | -0.354 |
| 72.88 | -0.367 |
| 72.9 | -0.375 |
| 72.92 | -0.38 |
| 72.94 | -0.383 |
| 72.96 | -0.384 |
| 72.98 | -0.385 |
| 73.0 | -0.385 |
| 73.02 | -0.385 |
| 73.04 | -0.384 |
| 73.06 | -0.384 |
| 73.08 | -0.383 |
| 73.1 | -0.383 |
| 73.12 | -0.382 |
| 73.14 | -0.382 |
| 73.16 | -0.381 |
| 73.18 | -0.381 |
| 73.2 | -0.38 |
| 73.22 | -0.379 |
| 73.24 | -0.379 |
| 73.26 | -0.378 |
| 73.28 | -0.378 |
| 73.3 | -0.377 |
| 73.32 | -0.377 |
| 73.34 | -0.376 |
| 73.36 | -0.376 |
| 73.38 | -0.375 |
| 73.4 | -0.375 |
| 73.42 | -0.374 |
| 73.44 | -0.374 |
| 73.46 | -0.373 |
| 73.48 | -0.372 |
| 73.5 | -0.372 |
| 73.52 | -0.371 |
| 73.54 | -0.371 |
| 73.56 | -0.37 |
| 73.58 | -0.37 |
| 73.6 | -0.37 |
| 73.62 | -0.369 |
| 73.64 | -0.369 |
| 73.66 | -0.368 |
| 73.68 | -0.368 |
| 73.7 | -0.367 |
| 73.72 | -0.367 |
| 73.74 | -0.366 |
| 73.76 | -0.366 |
| 73.78 | -0.365 |
| 73.8 | -0.365 |
| 73.82 | -0.364 |
| 73.84 | -0.364 |
| 73.86 | -0.363 |
| 73.88 | -0.363 |
| 73.9 | -0.362 |
| 73.92 | -0.362 |
| 73.94 | -0.362 |
| 73.96 | -0.361 |
| 73.98 | -0.361 |
| 74.0 | -0.36 |
| 74.02 | -0.36 |
| 74.04 | -0.36 |
| 74.06 | -0.359 |
| 74.08 | -0.359 |
| 74.1 | -0.358 |
| 74.12 | -0.358 |
| 74.14 | -0.358 |
| 74.16 | -0.357 |
| 74.18 | -0.357 |
| 74.2 | -0.357 |
| 74.22 | -0.356 |
| 74.24 | -0.356 |
| 74.26 | -0.356 |
| 74.28 | -0.356 |
| 74.3 | -0.355 |
| 74.32 | -0.355 |
| 74.34 | -0.355 |
| 74.36 | -0.354 |
| 74.38 | -0.354 |
| 74.4 | -0.354 |
| 74.42 | -0.354 |
| 74.44 | -0.353 |
| 74.46 | -0.353 |
| 74.48 | -0.353 |
| 74.5 | -0.353 |
| 74.52 | -0.353 |
| 74.54 | -0.352 |
| 74.56 | -0.352 |
| 74.58 | -0.352 |
| 74.6 | -0.352 |
| 74.62 | -0.352 |
| 74.64 | -0.351 |
| 74.66 | -0.351 |
| 74.68 | -0.351 |
| 74.7 | -0.351 |
| 74.72 | -0.351 |
| 74.74 | -0.351 |
| 74.76 | -0.351 |
| 74.78 | -0.351 |
| 74.8 | -0.351 |
| 74.82 | -0.35 |
| 74.84 | -0.35 |
| 74.86 | -0.35 |
| 74.88 | -0.35 |
| 74.9 | -0.35 |
| 74.92 | -0.35 |
| 74.94 | -0.35 |
| 74.96 | -0.349 |
| 74.98 | -0.348 |
| 75.0 | -0.341 |
| 75.02 | -0.326 |
| 75.04 | -0.297 |
| 75.06 | -0.256 |
| 75.08 | -0.214 |
| 75.1 | -0.192 |
| 75.12 | -0.273 |
| 75.14 | -0.332 |
| 75.16 | -0.343 |
| 75.18 | -0.346 |
| 75.2 | -0.346 |
| 75.22 | -0.344 |
| 75.24 | -0.337 |
| 75.26 | -0.322 |
| 75.28 | -0.302 |
| 75.3 | -0.281 |
| 75.32 | -0.272 |
| 75.34 | -0.316 |
| 75.36 | -0.343 |
| 75.38 | -0.347 |
| 75.4 | -0.349 |
| 75.42 | -0.35 |
| 75.44 | -0.351 |
| 75.46 | -0.351 |
| 75.48 | -0.351 |
| 75.5 | -0.352 |
| 75.52 | -0.352 |
| 75.54 | -0.351 |
| 75.56 | -0.351 |
| 75.58 | -0.349 |
| 75.6 | -0.345 |
| 75.62 | -0.336 |
| 75.64 | -0.318 |
| 75.66 | -0.288 |
| 75.68 | -0.242 |
| 75.7 | -0.181 |
| 75.72 | -0.111 |
| 75.74 | -0.044 |
| 75.76 | 0.005 |
| 75.78 | 0.022 |
| 75.8 | 0.002 |
| 75.82 | -0.049 |
| 75.84 | -0.116 |
| 75.86 | -0.18 |
| 75.88 | -0.226 |
| 75.9 | -0.249 |
| 75.92 | -0.247 |
| 75.94 | -0.228 |
| 75.96 | -0.202 |
| 75.98 | -0.181 |
| 76.0 | -0.172 |
| 76.02 | -0.182 |
| 76.04 | -0.206 |
| 76.06 | -0.239 |
| 76.08 | -0.272 |
| 76.1 | -0.297 |
| 76.12 | -0.312 |
| 76.14 | -0.315 |
| 76.16 | -0.307 |
| 76.18 | -0.29 |
| 76.2 | -0.267 |
| 76.22 | -0.237 |
| 76.24 | -0.204 |
| 76.26 | -0.17 |
| 76.28 | -0.137 |
| 76.3 | -0.108 |
| 76.32 | -0.086 |
| 76.34 | -0.073 |
| 76.36 | -0.07 |
| 76.38 | -0.076 |
| 76.4 | -0.089 |
| 76.42 | -0.107 |
| 76.44 | -0.127 |
| 76.46 | -0.145 |
| 76.48 | -0.161 |
| 76.5 | -0.173 |
| 76.52 | -0.18 |
| 76.54 | -0.183 |
| 76.56 | -0.182 |
| 76.58 | -0.177 |
| 76.6 | -0.168 |
| 76.62 | -0.154 |
| 76.64 | -0.135 |
| 76.66 | -0.114 |
| 76.68 | -0.092 |
| 76.7 | -0.073 |
| 76.72 | -0.062 |
| 76.74 | -0.062 |
| 76.76 | -0.075 |
| 76.78 | -0.1 |
| 76.8 | -0.132 |
| 76.82 | -0.166 |
| 76.84 | -0.196 |
| 76.86 | -0.218 |
| 76.88 | -0.23 |
| 76.9 | -0.232 |
| 76.92 | -0.226 |
| 76.94 | -0.216 |
| 76.96 | -0.205 |
| 76.98 | -0.195 |
| 77.0 | -0.186 |
| 77.02 | -0.178 |
| 77.04 | -0.166 |
| 77.06 | -0.15 |
| 77.08 | -0.125 |
| 77.1 | -0.09 |
| 77.12 | -0.046 |
| 77.14 | 0.007 |
| 77.16 | 0.065 |
| 77.18 | 0.127 |
| 77.2 | 0.189 |
| 77.22 | 0.246 |
| 77.24 | 0.297 |
| 77.26 | 0.339 |
| 77.28 | 0.369 |
| 77.3 | 0.386 |
| 77.32 | 0.392 |
| 77.34 | 0.385 |
| 77.36 | 0.369 |
| 77.38 | 0.344 |
| 77.4 | 0.313 |
| 77.42 | 0.278 |
| 77.44 | 0.24 |
| 77.46 | 0.2 |
| 77.48 | 0.16 |
| 77.5 | 0.118 |
| 77.52 | 0.076 |
| 77.54 | 0.033 |
| 77.56 | -0.011 |
| 77.58 | -0.055 |
| 77.6 | -0.099 |
| 77.62 | -0.142 |
| 77.64 | -0.184 |
| 77.66 | -0.223 |
| 77.68 | -0.259 |
| 77.7 | -0.292 |
| 77.72 | -0.321 |
| 77.74 | -0.346 |
| 77.76 | -0.366 |
| 77.78 | -0.383 |
| 77.8 | -0.397 |
| 77.82 | -0.407 |
| 77.84 | -0.415 |
| 77.86 | -0.421 |
| 77.88 | -0.425 |
| 77.9 | -0.428 |
| 77.92 | -0.43 |
| 77.94 | -0.432 |
| 77.96 | -0.432 |
| 77.98 | -0.432 |
| 78.0 | -0.431 |
| 78.02 | -0.429 |
| 78.04 | -0.426 |
| 78.06 | -0.421 |
| 78.08 | -0.412 |
| 78.1 | -0.401 |
| 78.12 | -0.385 |
| 78.14 | -0.364 |
| 78.16 | -0.336 |
| 78.18 | -0.3 |
| 78.2 | -0.258 |
| 78.22 | -0.207 |
| 78.24 | -0.149 |
| 78.26 | -0.085 |
| 78.28 | -0.016 |
| 78.3 | 0.054 |
| 78.32 | 0.122 |
| 78.34 | 0.186 |
| 78.36 | 0.241 |
| 78.38 | 0.285 |
| 78.4 | 0.316 |
| 78.42 | 0.332 |
| 78.44 | 0.334 |
| 78.46 | 0.324 |
| 78.48 | 0.303 |
| 78.5 | 0.274 |
| 78.52 | 0.239 |
| 78.54 | 0.202 |
| 78.56 | 0.165 |
| 78.58 | 0.127 |
| 78.6 | 0.09 |
| 78.62 | 0.052 |
| 78.64 | 0.015 |
| 78.66 | -0.024 |
| 78.68 | -0.064 |
| 78.7 | -0.106 |
| 78.72 | -0.149 |
| 78.74 | -0.191 |
| 78.76 | -0.233 |
| 78.78 | -0.273 |
| 78.8 | -0.31 |
| 78.82 | -0.343 |
| 78.84 | -0.371 |
| 78.86 | -0.396 |
| 78.88 | -0.416 |
| 78.9 | -0.432 |
| 78.92 | -0.444 |
| 78.94 | -0.453 |
| 78.96 | -0.46 |
| 78.98 | -0.465 |
| 79.0 | -0.469 |
| 79.02 | -0.471 |
| 79.04 | -0.473 |
| 79.06 | -0.474 |
| 79.08 | -0.475 |
| 79.1 | -0.476 |
| 79.12 | -0.477 |
| 79.14 | -0.477 |
| 79.16 | -0.478 |
| 79.18 | -0.478 |
| 79.2 | -0.478 |
| 79.22 | -0.479 |
| 79.24 | -0.479 |
| 79.26 | -0.479 |
| 79.28 | -0.48 |
| 79.3 | -0.48 |
| 79.32 | -0.48 |
| 79.34 | -0.481 |
| 79.36 | -0.481 |
| 79.38 | -0.481 |
| 79.4 | -0.481 |
| 79.42 | -0.482 |
| 79.44 | -0.482 |
| 79.46 | -0.482 |
| 79.48 | -0.482 |
| 79.5 | -0.483 |
| 79.52 | -0.483 |
| 79.54 | -0.483 |
| 79.56 | -0.483 |
| 79.58 | -0.483 |
| 79.6 | -0.484 |
| 79.62 | -0.484 |
| 79.64 | -0.484 |
| 79.66 | -0.484 |
| 79.68 | -0.484 |
| 79.7 | -0.484 |
| 79.72 | -0.484 |
| 79.74 | -0.485 |
| 79.76 | -0.485 |
| 79.78 | -0.485 |
| 79.8 | -0.485 |
| 79.82 | -0.485 |
| 79.84 | -0.485 |
| 79.86 | -0.485 |
| 79.88 | -0.485 |
| 79.9 | -0.485 |
| 79.92 | -0.485 |
| 79.94 | -0.485 |
| 79.96 | -0.485 |
| 79.98 | -0.485 |
| 80.0 | -0.485 |
| 80.02 | -0.485 |
| 80.04 | -0.485 |
| 80.06 | -0.485 |
| 80.08 | -0.485 |
| 80.1 | -0.485 |
| 80.12 | -0.485 |
| 80.14 | -0.485 |
| 80.16 | -0.485 |
| 80.18 | -0.485 |
| 80.2 | -0.485 |
| 80.22 | -0.485 |
| 80.24 | -0.485 |
| 80.26 | -0.485 |
| 80.28 | -0.485 |
| 80.3 | -0.485 |
| 80.32 | -0.484 |
| 80.34 | -0.484 |
| 80.36 | -0.484 |
| 80.38 | -0.484 |
| 80.4 | -0.484 |
| 80.42 | -0.484 |
| 80.44 | -0.484 |
| 80.46 | -0.484 |
| 80.48 | -0.483 |
| 80.5 | -0.483 |
| 80.52 | -0.483 |
| 80.54 | -0.483 |
| 80.56 | -0.483 |
| 80.58 | -0.483 |
| 80.6 | -0.482 |
| 80.62 | -0.482 |
| 80.64 | -0.482 |
| 80.66 | -0.482 |
| 80.68 | -0.481 |
| 80.7 | -0.481 |
| 80.72 | -0.481 |
| 80.74 | -0.481 |
| 80.76 | -0.48 |
| 80.78 | -0.48 |
| 80.8 | -0.48 |
| 80.82 | -0.48 |
| 80.84 | -0.479 |
| 80.86 | -0.479 |
| 80.88 | -0.479 |
| 80.9 | -0.479 |
| 80.92 | -0.478 |
| 80.94 | -0.478 |
| 80.96 | -0.478 |
| 80.98 | -0.477 |
| 81.0 | -0.477 |
| 81.02 | -0.477 |
| 81.04 | -0.476 |
| 81.06 | -0.476 |
| 81.08 | -0.476 |
| 81.1 | -0.475 |
| 81.12 | -0.475 |
| 81.14 | -0.475 |
| 81.16 | -0.474 |
| 81.18 | -0.474 |
| 81.2 | -0.473 |
| 81.22 | -0.473 |
| 81.24 | -0.472 |
| 81.26 | -0.471 |
| 81.28 | -0.471 |
| 81.3 | -0.47 |
| 81.32 | -0.469 |
| 81.34 | -0.467 |
| 81.36 | -0.466 |
| 81.38 | -0.464 |
| 81.4 | -0.462 |
| 81.42 | -0.46 |
| 81.44 | -0.457 |
| 81.46 | -0.454 |
| 81.48 | -0.45 |
| 81.5 | -0.445 |
| 81.52 | -0.44 |
| 81.54 | -0.434 |
| 81.56 | -0.428 |
| 81.58 | -0.42 |
| 81.6 | -0.412 |
| 81.62 | -0.403 |
| 81.64 | -0.393 |
| 81.66 | -0.382 |
| 81.68 | -0.37 |
| 81.7 | -0.358 |
| 81.72 | -0.344 |
| 81.74 | -0.331 |
| 81.76 | -0.317 |
| 81.78 | -0.302 |
| 81.8 | -0.288 |
| 81.82 | -0.273 |
| 81.84 | -0.26 |
| 81.86 | -0.246 |
| 81.88 | -0.233 |
| 81.9 | -0.221 |
| 81.92 | -0.211 |
| 81.94 | -0.201 |
| 81.96 | -0.193 |
| 81.98 | -0.187 |
| 82.0 | -0.191 |
| 82.02 | -0.207 |
| 82.04 | -0.23 |
| 82.06 | -0.256 |
| 82.08 | -0.281 |
| 82.1 | -0.302 |
| 82.12 | -0.318 |
| 82.14 | -0.329 |
| 82.16 | -0.335 |
| 82.18 | -0.338 |
| 82.2 | -0.34 |
| 82.22 | -0.34 |
| 82.24 | -0.343 |
| 82.26 | -0.352 |
| 82.28 | -0.365 |
| 82.3 | -0.379 |
| 82.32 | -0.394 |
| 82.34 | -0.407 |
| 82.36 | -0.418 |
| 82.38 | -0.425 |
| 82.4 | -0.43 |
| 82.42 | -0.433 |
| 82.44 | -0.434 |
| 82.46 | -0.434 |
| 82.48 | -0.433 |
| 82.5 | -0.432 |
| 82.52 | -0.431 |
| 82.54 | -0.43 |
| 82.56 | -0.429 |
| 82.58 | -0.427 |
| 82.6 | -0.426 |
| 82.62 | -0.424 |
| 82.64 | -0.423 |
| 82.66 | -0.421 |
| 82.68 | -0.419 |
| 82.7 | -0.417 |
| 82.72 | -0.416 |
| 82.74 | -0.414 |
| 82.76 | -0.411 |
| 82.78 | -0.409 |
| 82.8 | -0.407 |
| 82.82 | -0.405 |
| 82.84 | -0.401 |
| 82.86 | -0.399 |
| 82.88 | -0.396 |
| 82.9 | -0.393 |
| 82.92 | -0.389 |
| 82.94 | -0.386 |
| 82.96 | -0.382 |
| 82.98 | -0.378 |
| 83.0 | -0.374 |
| 83.02 | -0.369 |
| 83.04 | -0.364 |
| 83.06 | -0.359 |
| 83.08 | -0.353 |
| 83.1 | -0.347 |
| 83.12 | -0.34 |
| 83.14 | -0.333 |
| 83.16 | -0.326 |
| 83.18 | -0.318 |
| 83.2 | -0.31 |
| 83.22 | -0.301 |
| 83.24 | -0.292 |
| 83.26 | -0.283 |
| 83.28 | -0.273 |
| 83.3 | -0.262 |
| 83.32 | -0.251 |
| 83.34 | -0.24 |
| 83.36 | -0.227 |
| 83.38 | -0.214 |
| 83.4 | -0.199 |
| 83.42 | -0.182 |
| 83.44 | -0.162 |
| 83.46 | -0.14 |
| 83.48 | -0.115 |
| 83.5 | -0.086 |
| 83.52 | -0.053 |
| 83.54 | -0.017 |
| 83.56 | 0.021 |
| 83.58 | 0.059 |
| 83.6 | 0.095 |
| 83.62 | 0.125 |
| 83.64 | 0.147 |
| 83.66 | 0.157 |
| 83.68 | 0.069 |
| 83.7 | -0.095 |
| 83.72 | -0.222 |
| 83.74 | -0.276 |
| 83.76 | -0.283 |
| 83.78 | -0.272 |
| 83.8 | -0.256 |
| 83.82 | -0.238 |
| 83.84 | -0.22 |
| 83.86 | -0.205 |
| 83.88 | -0.192 |
| 83.9 | -0.185 |
| 83.92 | -0.188 |
| 83.94 | -0.25 |
| 83.96 | -0.334 |
| 83.98 | -0.391 |
| 84.0 | -0.414 |
| 84.02 | -0.418 |
| 84.04 | -0.417 |
| 84.06 | -0.414 |
| 84.08 | -0.41 |
| 84.1 | -0.406 |
| 84.12 | -0.402 |
| 84.14 | -0.397 |
| 84.16 | -0.391 |
| 84.18 | -0.384 |
| 84.2 | -0.376 |
| 84.22 | -0.366 |
| 84.24 | -0.355 |
| 84.26 | -0.343 |
| 84.28 | -0.328 |
| 84.3 | -0.311 |
| 84.32 | -0.29 |
| 84.34 | -0.266 |
| 84.36 | -0.235 |
| 84.38 | -0.198 |
| 84.4 | -0.151 |
| 84.42 | -0.092 |
| 84.44 | -0.025 |
| 84.46 | 0.045 |
| 84.48 | 0.1 |
| 84.5 | 0.125 |
| 84.52 | 0.109 |
| 84.54 | 0.059 |
| 84.56 | -0.007 |
| 84.58 | -0.072 |
| 84.6 | -0.128 |
| 84.62 | -0.17 |
| 84.64 | -0.196 |
| 84.66 | -0.207 |
| 84.68 | -0.204 |
| 84.7 | -0.189 |
| 84.72 | -0.169 |
| 84.74 | -0.154 |
| 84.76 | -0.152 |
| 84.78 | -0.17 |
| 84.8 | -0.203 |
| 84.82 | -0.244 |
| 84.84 | -0.284 |
| 84.86 | -0.319 |
| 84.88 | -0.349 |
| 84.9 | -0.372 |
| 84.92 | -0.39 |
| 84.94 | -0.403 |
| 84.96 | -0.413 |
| 84.98 | -0.42 |
| 85.0 | -0.425 |
| 85.02 | -0.429 |
| 85.04 | -0.432 |
| 85.06 | -0.435 |
| 85.08 | -0.437 |
| 85.1 | -0.439 |
| 85.12 | -0.44 |
| 85.14 | -0.442 |
| 85.16 | -0.443 |
| 85.18 | -0.443 |
| 85.2 | -0.444 |
| 85.22 | -0.444 |
| 85.24 | -0.445 |
| 85.26 | -0.445 |
| 85.28 | -0.444 |
| 85.3 | -0.444 |
| 85.32 | -0.443 |
| 85.34 | -0.442 |
| 85.36 | -0.441 |
| 85.38 | -0.439 |
| 85.4 | -0.437 |
| 85.42 | -0.434 |
| 85.44 | -0.43 |
| 85.46 | -0.425 |
| 85.48 | -0.418 |
| 85.5 | -0.41 |
| 85.52 | -0.4 |
| 85.54 | -0.389 |
| 85.56 | -0.378 |
| 85.58 | -0.365 |
| 85.6 | -0.347 |
| 85.62 | -0.313 |
| 85.64 | -0.262 |
| 85.66 | -0.228 |
| 85.68 | -0.232 |
| 85.7 | -0.252 |
| 85.72 | -0.281 |
| 85.74 | -0.315 |
| 85.76 | -0.347 |
| 85.78 | -0.374 |
| 85.8 | -0.394 |
| 85.82 | -0.406 |
| 85.84 | -0.412 |
| 85.86 | -0.411 |
| 85.88 | -0.4 |
| 85.9 | -0.378 |
| 85.92 | -0.359 |
| 85.94 | -0.36 |
| 85.96 | -0.37 |
| 85.98 | -0.385 |
| 86.0 | -0.403 |
| 86.02 | -0.422 |
| 86.04 | -0.439 |
| 86.06 | -0.452 |
| 86.08 | -0.461 |
| 86.1 | -0.468 |
| 86.12 | -0.472 |
| 86.14 | -0.474 |
| 86.16 | -0.476 |
| 86.18 | -0.476 |
| 86.2 | -0.477 |
| 86.22 | -0.477 |
| 86.24 | -0.478 |
| 86.26 | -0.478 |
| 86.28 | -0.478 |
| 86.3 | -0.478 |
| 86.32 | -0.479 |
| 86.34 | -0.479 |
| 86.36 | -0.479 |
| 86.38 | -0.48 |
| 86.4 | -0.48 |
| 86.42 | -0.48 |
| 86.44 | -0.48 |
| 86.46 | -0.481 |
| 86.48 | -0.481 |
| 86.5 | -0.481 |
| 86.52 | -0.481 |
| 86.54 | -0.481 |
| 86.56 | -0.482 |
| 86.58 | -0.482 |
| 86.6 | -0.482 |
| 86.62 | -0.482 |
| 86.64 | -0.482 |
| 86.66 | -0.482 |
| 86.68 | -0.483 |
| 86.7 | -0.483 |
| 86.72 | -0.483 |
| 86.74 | -0.483 |
| 86.76 | -0.483 |
| 86.78 | -0.483 |
| 86.8 | -0.483 |
| 86.82 | -0.483 |
| 86.84 | -0.483 |
| 86.86 | -0.483 |
| 86.88 | -0.483 |
| 86.9 | -0.482 |
| 86.92 | -0.482 |
| 86.94 | -0.482 |
| 86.96 | -0.482 |
| 86.98 | -0.481 |
| 87.0 | -0.481 |
| 87.02 | -0.48 |
| 87.04 | -0.479 |
| 87.06 | -0.479 |
| 87.08 | -0.478 |
| 87.1 | -0.476 |
| 87.12 | -0.475 |
| 87.14 | -0.473 |
| 87.16 | -0.471 |
| 87.18 | -0.468 |
| 87.2 | -0.464 |
| 87.22 | -0.459 |
| 87.24 | -0.452 |
| 87.26 | -0.444 |
| 87.28 | -0.432 |
| 87.3 | -0.417 |
| 87.32 | -0.398 |
| 87.34 | -0.375 |
| 87.36 | -0.347 |
| 87.38 | -0.315 |
| 87.4 | -0.28 |
| 87.42 | -0.241 |
| 87.44 | -0.2 |
| 87.46 | -0.161 |
| 87.48 | -0.124 |
| 87.5 | -0.095 |
| 87.52 | -0.076 |
| 87.54 | -0.069 |
| 87.56 | -0.071 |
| 87.58 | -0.079 |
| 87.6 | -0.092 |
| 87.62 | -0.106 |
| 87.64 | -0.119 |
| 87.66 | -0.128 |
| 87.68 | -0.133 |
| 87.7 | -0.134 |
| 87.72 | -0.131 |
| 87.74 | -0.125 |
| 87.76 | -0.12 |
| 87.78 | -0.116 |
| 87.8 | -0.117 |
| 87.82 | -0.123 |
| 87.84 | -0.133 |
| 87.86 | -0.147 |
| 87.88 | -0.163 |
| 87.9 | -0.181 |
| 87.92 | -0.198 |
| 87.94 | -0.215 |
| 87.96 | -0.231 |
| 87.98 | -0.245 |
| 88.0 | -0.257 |
| 88.02 | -0.267 |
| 88.04 | -0.276 |
| 88.06 | -0.284 |
| 88.08 | -0.291 |
| 88.1 | -0.297 |
| 88.12 | -0.302 |
| 88.14 | -0.306 |
| 88.16 | -0.31 |
| 88.18 | -0.314 |
| 88.2 | -0.317 |
| 88.22 | -0.319 |
| 88.24 | -0.321 |
| 88.26 | -0.322 |
| 88.28 | -0.322 |
| 88.3 | -0.321 |
| 88.32 | -0.319 |
| 88.34 | -0.316 |
| 88.36 | -0.311 |
| 88.38 | -0.305 |
| 88.4 | -0.297 |
| 88.42 | -0.286 |
| 88.44 | -0.273 |
| 88.46 | -0.258 |
| 88.48 | -0.239 |
| 88.5 | -0.217 |
| 88.52 | -0.19 |
| 88.54 | -0.159 |
| 88.56 | -0.12 |
| 88.58 | -0.073 |
| 88.6 | -0.014 |
| 88.62 | 0.059 |
| 88.64 | 0.147 |
| 88.66 | 0.247 |
| 88.68 | 0.352 |
| 88.7 | 0.442 |
| 88.72 | 0.498 |
| 88.74 | 0.498 |
| 88.76 | 0.428 |
| 88.78 | 0.317 |
| 88.8 | 0.2 |
| 88.82 | 0.099 |
| 88.84 | 0.021 |
| 88.86 | -0.032 |
| 88.88 | -0.062 |
| 88.9 | -0.072 |
| 88.92 | -0.064 |
| 88.94 | -0.041 |
| 88.96 | -0.013 |
| 88.98 | 0.013 |
| 89.0 | 0.022 |
| 89.02 | 0.004 |
| 89.04 | -0.047 |
| 89.06 | -0.116 |
| 89.08 | -0.187 |
| 89.1 | -0.25 |
| 89.12 | -0.302 |
| 89.14 | -0.344 |
| 89.16 | -0.376 |
| 89.18 | -0.401 |
| 89.2 | -0.421 |
| 89.22 | -0.436 |
| 89.24 | -0.449 |
| 89.26 | -0.459 |
| 89.28 | -0.467 |
| 89.3 | -0.474 |
| 89.32 | -0.481 |
| 89.34 | -0.486 |
| 89.36 | -0.491 |
| 89.38 | -0.495 |
| 89.4 | -0.499 |
| 89.42 | -0.502 |
| 89.44 | -0.505 |
| 89.46 | -0.508 |
| 89.48 | -0.51 |
| 89.5 | -0.513 |
| 89.52 | -0.515 |
| 89.54 | -0.517 |
| 89.56 | -0.519 |
| 89.58 | -0.521 |
| 89.6 | -0.522 |
| 89.62 | -0.524 |
| 89.64 | -0.525 |
| 89.66 | -0.527 |
| 89.68 | -0.528 |
| 89.7 | -0.529 |
| 89.72 | -0.531 |
| 89.74 | -0.532 |
| 89.76 | -0.533 |
| 89.78 | -0.534 |
| 89.8 | -0.535 |
| 89.82 | -0.536 |
| 89.84 | -0.537 |
| 89.86 | -0.538 |
| 89.88 | -0.539 |
| 89.9 | -0.539 |
| 89.92 | -0.54 |
| 89.94 | -0.541 |
| 89.96 | -0.542 |
| 89.98 | -0.543 |
| 90.0 | -0.543 |